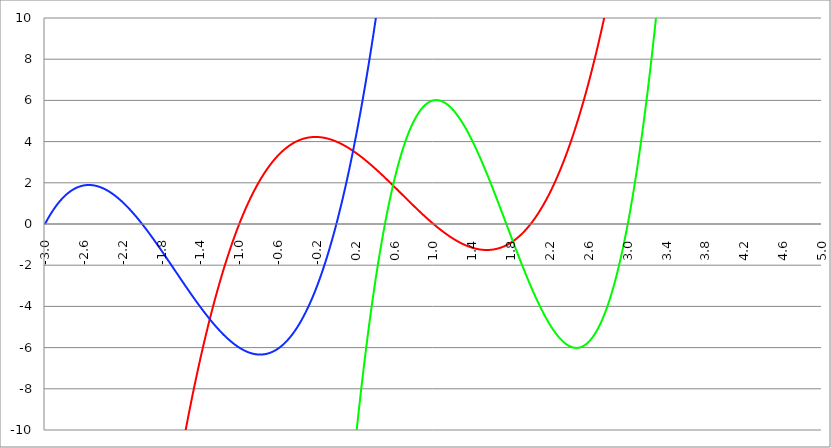
| Category | Series 1 | Series 0 | Series 2 |
|---|---|---|---|
| -3.0 | -80 | -798 | 0 |
| -2.996 | -79.696 | -795.886 | 0.036 |
| -2.992 | -79.393 | -793.775 | 0.071 |
| -2.988 | -79.091 | -791.668 | 0.106 |
| -2.984 | -78.79 | -789.565 | 0.141 |
| -2.98 | -78.489 | -787.466 | 0.175 |
| -2.976 | -78.189 | -785.37 | 0.209 |
| -2.972 | -77.889 | -783.277 | 0.243 |
| -2.968 | -77.59 | -781.188 | 0.276 |
| -2.964 | -77.292 | -779.103 | 0.309 |
| -2.96 | -76.995 | -777.022 | 0.341 |
| -2.956 | -76.698 | -774.944 | 0.373 |
| -2.952 | -76.402 | -772.87 | 0.405 |
| -2.948 | -76.107 | -770.799 | 0.436 |
| -2.944 | -75.813 | -768.732 | 0.467 |
| -2.94 | -75.519 | -766.669 | 0.497 |
| -2.936 | -75.226 | -764.609 | 0.528 |
| -2.932 | -74.933 | -762.553 | 0.557 |
| -2.928 | -74.641 | -760.5 | 0.587 |
| -2.924 | -74.35 | -758.451 | 0.616 |
| -2.92 | -74.06 | -756.406 | 0.645 |
| -2.916 | -73.77 | -754.364 | 0.673 |
| -2.912 | -73.481 | -752.325 | 0.701 |
| -2.908 | -73.193 | -750.291 | 0.729 |
| -2.904 | -72.905 | -748.26 | 0.756 |
| -2.9 | -72.618 | -746.232 | 0.783 |
| -2.896 | -72.332 | -744.208 | 0.81 |
| -2.892 | -72.046 | -742.188 | 0.836 |
| -2.888 | -71.761 | -740.171 | 0.862 |
| -2.884 | -71.477 | -738.157 | 0.887 |
| -2.88 | -71.193 | -736.148 | 0.912 |
| -2.876 | -70.91 | -734.142 | 0.937 |
| -2.872 | -70.628 | -732.139 | 0.962 |
| -2.868 | -70.347 | -730.14 | 0.986 |
| -2.864 | -70.066 | -728.144 | 1.01 |
| -2.86 | -69.786 | -726.152 | 1.033 |
| -2.856 | -69.506 | -724.164 | 1.056 |
| -2.852 | -69.227 | -722.179 | 1.079 |
| -2.848 | -68.949 | -720.198 | 1.101 |
| -2.844 | -68.672 | -718.22 | 1.123 |
| -2.84 | -68.395 | -716.246 | 1.145 |
| -2.836 | -68.119 | -714.275 | 1.166 |
| -2.832 | -67.843 | -712.308 | 1.188 |
| -2.828 | -67.569 | -710.344 | 1.208 |
| -2.824 | -67.295 | -708.384 | 1.229 |
| -2.82 | -67.021 | -706.427 | 1.249 |
| -2.816 | -66.748 | -704.474 | 1.268 |
| -2.812 | -66.476 | -702.524 | 1.288 |
| -2.808 | -66.205 | -700.578 | 1.307 |
| -2.804 | -65.934 | -698.635 | 1.326 |
| -2.8 | -65.664 | -696.696 | 1.344 |
| -2.796 | -65.395 | -694.76 | 1.362 |
| -2.792 | -65.126 | -692.828 | 1.38 |
| -2.788 | -64.858 | -690.899 | 1.397 |
| -2.784 | -64.59 | -688.974 | 1.414 |
| -2.78 | -64.324 | -687.052 | 1.431 |
| -2.776 | -64.057 | -685.134 | 1.448 |
| -2.772 | -63.792 | -683.219 | 1.464 |
| -2.768 | -63.527 | -681.308 | 1.48 |
| -2.764 | -63.263 | -679.4 | 1.495 |
| -2.76 | -63 | -677.496 | 1.51 |
| -2.756 | -62.737 | -675.595 | 1.525 |
| -2.752 | -62.475 | -673.697 | 1.54 |
| -2.748 | -62.213 | -671.803 | 1.554 |
| -2.744 | -61.952 | -669.913 | 1.568 |
| -2.74 | -61.692 | -668.026 | 1.582 |
| -2.736 | -61.433 | -666.142 | 1.595 |
| -2.732 | -61.174 | -664.262 | 1.608 |
| -2.728 | -60.915 | -662.385 | 1.621 |
| -2.724 | -60.658 | -660.512 | 1.633 |
| -2.72 | -60.401 | -658.642 | 1.645 |
| -2.716 | -60.145 | -656.776 | 1.657 |
| -2.712 | -59.889 | -654.913 | 1.668 |
| -2.708 | -59.634 | -653.053 | 1.68 |
| -2.704 | -59.38 | -651.197 | 1.69 |
| -2.7 | -59.126 | -649.344 | 1.701 |
| -2.696 | -58.873 | -647.495 | 1.711 |
| -2.692 | -58.621 | -645.649 | 1.721 |
| -2.688 | -58.369 | -643.806 | 1.731 |
| -2.684 | -58.118 | -641.967 | 1.74 |
| -2.68 | -57.867 | -640.131 | 1.75 |
| -2.676 | -57.617 | -638.299 | 1.758 |
| -2.672 | -57.368 | -636.47 | 1.767 |
| -2.668 | -57.12 | -634.645 | 1.775 |
| -2.664 | -56.872 | -632.823 | 1.783 |
| -2.66 | -56.625 | -631.004 | 1.791 |
| -2.656 | -56.378 | -629.189 | 1.798 |
| -2.652 | -56.132 | -627.377 | 1.805 |
| -2.648 | -55.887 | -625.568 | 1.812 |
| -2.644 | -55.642 | -623.763 | 1.819 |
| -2.64 | -55.398 | -621.961 | 1.825 |
| -2.636 | -55.154 | -620.163 | 1.831 |
| -2.632 | -54.912 | -618.368 | 1.836 |
| -2.628 | -54.669 | -616.576 | 1.842 |
| -2.624 | -54.428 | -614.788 | 1.847 |
| -2.62 | -54.187 | -613.003 | 1.852 |
| -2.616 | -53.947 | -611.221 | 1.856 |
| -2.612 | -53.707 | -609.443 | 1.861 |
| -2.608 | -53.468 | -607.668 | 1.865 |
| -2.604 | -53.23 | -605.896 | 1.869 |
| -2.6 | -52.992 | -604.128 | 1.872 |
| -2.596 | -52.755 | -602.363 | 1.875 |
| -2.592 | -52.518 | -600.602 | 1.878 |
| -2.588 | -52.282 | -598.843 | 1.881 |
| -2.584 | -52.047 | -597.088 | 1.883 |
| -2.58 | -51.813 | -595.337 | 1.885 |
| -2.576 | -51.579 | -593.589 | 1.887 |
| -2.572 | -51.345 | -591.844 | 1.889 |
| -2.568 | -51.112 | -590.102 | 1.89 |
| -2.564 | -50.88 | -588.364 | 1.891 |
| -2.56 | -50.649 | -586.629 | 1.892 |
| -2.556 | -50.418 | -584.897 | 1.893 |
| -2.552 | -50.188 | -583.169 | 1.893 |
| -2.548 | -49.958 | -581.444 | 1.893 |
| -2.544 | -49.729 | -579.722 | 1.893 |
| -2.54 | -49.501 | -578.004 | 1.893 |
| -2.536 | -49.273 | -576.289 | 1.892 |
| -2.532 | -49.046 | -574.577 | 1.891 |
| -2.528 | -48.819 | -572.868 | 1.89 |
| -2.524 | -48.593 | -571.163 | 1.889 |
| -2.52 | -48.368 | -569.461 | 1.887 |
| -2.516 | -48.143 | -567.762 | 1.885 |
| -2.512 | -47.919 | -566.067 | 1.883 |
| -2.508 | -47.695 | -564.375 | 1.881 |
| -2.504 | -47.472 | -562.686 | 1.878 |
| -2.5 | -47.25 | -561 | 1.875 |
| -2.496 | -47.028 | -559.318 | 1.872 |
| -2.492 | -46.807 | -557.639 | 1.869 |
| -2.488 | -46.587 | -555.963 | 1.865 |
| -2.484 | -46.367 | -554.29 | 1.861 |
| -2.48 | -46.148 | -552.621 | 1.857 |
| -2.476 | -45.929 | -550.955 | 1.853 |
| -2.472 | -45.711 | -549.292 | 1.848 |
| -2.467999999999999 | -45.493 | -547.632 | 1.843 |
| -2.463999999999999 | -45.277 | -545.976 | 1.838 |
| -2.459999999999999 | -45.06 | -544.323 | 1.833 |
| -2.455999999999999 | -44.845 | -542.673 | 1.828 |
| -2.451999999999999 | -44.63 | -541.026 | 1.822 |
| -2.447999999999999 | -44.415 | -539.383 | 1.816 |
| -2.443999999999999 | -44.201 | -537.742 | 1.81 |
| -2.439999999999999 | -43.988 | -536.105 | 1.804 |
| -2.435999999999999 | -43.775 | -534.472 | 1.797 |
| -2.431999999999999 | -43.563 | -532.841 | 1.79 |
| -2.427999999999999 | -43.352 | -531.214 | 1.783 |
| -2.423999999999999 | -43.141 | -529.59 | 1.776 |
| -2.419999999999999 | -42.931 | -527.969 | 1.769 |
| -2.415999999999999 | -42.721 | -526.351 | 1.761 |
| -2.411999999999999 | -42.512 | -524.736 | 1.753 |
| -2.407999999999999 | -42.303 | -523.125 | 1.745 |
| -2.403999999999999 | -42.095 | -521.517 | 1.737 |
| -2.399999999999999 | -41.888 | -519.912 | 1.728 |
| -2.395999999999999 | -41.681 | -518.31 | 1.719 |
| -2.391999999999999 | -41.475 | -516.712 | 1.71 |
| -2.387999999999999 | -41.27 | -515.116 | 1.701 |
| -2.383999999999999 | -41.065 | -513.524 | 1.692 |
| -2.379999999999999 | -40.86 | -511.935 | 1.682 |
| -2.375999999999999 | -40.656 | -510.349 | 1.672 |
| -2.371999999999999 | -40.453 | -508.766 | 1.662 |
| -2.367999999999999 | -40.25 | -507.187 | 1.652 |
| -2.363999999999999 | -40.048 | -505.61 | 1.642 |
| -2.359999999999999 | -39.847 | -504.037 | 1.631 |
| -2.355999999999999 | -39.646 | -502.467 | 1.62 |
| -2.351999999999999 | -39.446 | -500.9 | 1.609 |
| -2.347999999999999 | -39.246 | -499.337 | 1.598 |
| -2.343999999999999 | -39.047 | -497.776 | 1.587 |
| -2.339999999999999 | -38.848 | -496.218 | 1.575 |
| -2.335999999999999 | -38.65 | -494.664 | 1.564 |
| -2.331999999999999 | -38.453 | -493.113 | 1.552 |
| -2.327999999999999 | -38.256 | -491.565 | 1.539 |
| -2.323999999999999 | -38.06 | -490.02 | 1.527 |
| -2.319999999999999 | -37.864 | -488.478 | 1.514 |
| -2.315999999999999 | -37.669 | -486.939 | 1.502 |
| -2.311999999999999 | -37.474 | -485.404 | 1.489 |
| -2.307999999999999 | -37.28 | -483.872 | 1.476 |
| -2.303999999999999 | -37.087 | -482.342 | 1.462 |
| -2.299999999999999 | -36.894 | -480.816 | 1.449 |
| -2.295999999999999 | -36.702 | -479.293 | 1.435 |
| -2.291999999999999 | -36.51 | -477.773 | 1.422 |
| -2.288 | -36.319 | -476.256 | 1.408 |
| -2.284 | -36.128 | -474.742 | 1.393 |
| -2.279999999999999 | -35.938 | -473.232 | 1.379 |
| -2.275999999999999 | -35.749 | -471.724 | 1.364 |
| -2.271999999999999 | -35.56 | -470.22 | 1.35 |
| -2.268 | -35.372 | -468.718 | 1.335 |
| -2.264 | -35.184 | -467.22 | 1.32 |
| -2.259999999999999 | -34.997 | -465.725 | 1.304 |
| -2.255999999999999 | -34.81 | -464.232 | 1.289 |
| -2.251999999999999 | -34.624 | -462.743 | 1.273 |
| -2.248 | -34.439 | -461.257 | 1.258 |
| -2.244 | -34.254 | -459.774 | 1.242 |
| -2.239999999999999 | -34.069 | -458.295 | 1.226 |
| -2.235999999999999 | -33.885 | -456.818 | 1.209 |
| -2.231999999999999 | -33.702 | -455.344 | 1.193 |
| -2.228 | -33.519 | -453.873 | 1.176 |
| -2.224 | -33.337 | -452.406 | 1.16 |
| -2.219999999999999 | -33.156 | -450.941 | 1.143 |
| -2.215999999999999 | -32.975 | -449.48 | 1.126 |
| -2.211999999999999 | -32.794 | -448.021 | 1.109 |
| -2.208 | -32.614 | -446.566 | 1.091 |
| -2.204 | -32.435 | -445.113 | 1.074 |
| -2.199999999999999 | -32.256 | -443.664 | 1.056 |
| -2.195999999999999 | -32.078 | -442.218 | 1.038 |
| -2.191999999999999 | -31.9 | -440.774 | 1.02 |
| -2.188 | -31.723 | -439.334 | 1.002 |
| -2.184 | -31.546 | -437.897 | 0.984 |
| -2.179999999999999 | -31.37 | -436.463 | 0.965 |
| -2.175999999999999 | -31.195 | -435.031 | 0.947 |
| -2.171999999999999 | -31.02 | -433.603 | 0.928 |
| -2.168 | -30.845 | -432.178 | 0.909 |
| -2.164 | -30.671 | -430.756 | 0.89 |
| -2.159999999999999 | -30.498 | -429.337 | 0.871 |
| -2.155999999999999 | -30.325 | -427.921 | 0.852 |
| -2.151999999999999 | -30.153 | -426.507 | 0.832 |
| -2.148 | -29.981 | -425.097 | 0.813 |
| -2.144 | -29.81 | -423.69 | 0.793 |
| -2.139999999999999 | -29.639 | -422.286 | 0.773 |
| -2.135999999999999 | -29.469 | -420.885 | 0.753 |
| -2.131999999999999 | -29.299 | -419.487 | 0.733 |
| -2.128 | -29.13 | -418.091 | 0.713 |
| -2.124 | -28.962 | -416.699 | 0.692 |
| -2.119999999999999 | -28.794 | -415.31 | 0.672 |
| -2.115999999999999 | -28.626 | -413.924 | 0.651 |
| -2.111999999999999 | -28.46 | -412.54 | 0.63 |
| -2.108 | -28.293 | -411.16 | 0.609 |
| -2.104 | -28.127 | -409.782 | 0.588 |
| -2.099999999999999 | -27.962 | -408.408 | 0.567 |
| -2.095999999999999 | -27.797 | -407.037 | 0.546 |
| -2.091999999999999 | -27.633 | -405.668 | 0.524 |
| -2.088 | -27.469 | -404.302 | 0.503 |
| -2.084 | -27.306 | -402.94 | 0.481 |
| -2.079999999999999 | -27.143 | -401.58 | 0.459 |
| -2.075999999999999 | -26.981 | -400.223 | 0.437 |
| -2.071999999999999 | -26.82 | -398.87 | 0.415 |
| -2.068 | -26.659 | -397.519 | 0.393 |
| -2.064 | -26.498 | -396.171 | 0.371 |
| -2.059999999999999 | -26.338 | -394.826 | 0.349 |
| -2.055999999999999 | -26.179 | -393.484 | 0.326 |
| -2.051999999999999 | -26.02 | -392.144 | 0.303 |
| -2.048 | -25.861 | -390.808 | 0.281 |
| -2.044 | -25.703 | -389.475 | 0.258 |
| -2.039999999999999 | -25.546 | -388.145 | 0.235 |
| -2.035999999999999 | -25.389 | -386.817 | 0.212 |
| -2.031999999999999 | -25.232 | -385.492 | 0.189 |
| -2.028 | -25.077 | -384.171 | 0.166 |
| -2.024 | -24.921 | -382.852 | 0.142 |
| -2.019999999999999 | -24.766 | -381.536 | 0.119 |
| -2.015999999999999 | -24.612 | -380.223 | 0.095 |
| -2.011999999999999 | -24.458 | -378.913 | 0.072 |
| -2.008 | -24.305 | -377.606 | 0.048 |
| -2.004 | -24.152 | -376.301 | 0.024 |
| -1.999999999999999 | -24 | -375 | 0 |
| -1.995999999999999 | -23.848 | -373.701 | -0.024 |
| -1.991999999999999 | -23.697 | -372.406 | -0.048 |
| -1.987999999999999 | -23.546 | -371.113 | -0.072 |
| -1.983999999999999 | -23.396 | -369.823 | -0.097 |
| -1.979999999999999 | -23.246 | -368.536 | -0.121 |
| -1.975999999999999 | -23.097 | -367.252 | -0.146 |
| -1.971999999999999 | -22.949 | -365.97 | -0.17 |
| -1.967999999999999 | -22.8 | -364.692 | -0.195 |
| -1.963999999999999 | -22.653 | -363.416 | -0.22 |
| -1.959999999999999 | -22.505 | -362.143 | -0.245 |
| -1.955999999999999 | -22.359 | -360.874 | -0.27 |
| -1.951999999999999 | -22.213 | -359.606 | -0.295 |
| -1.947999999999999 | -22.067 | -358.342 | -0.32 |
| -1.943999999999999 | -21.922 | -357.081 | -0.345 |
| -1.939999999999999 | -21.777 | -355.822 | -0.37 |
| -1.935999999999999 | -21.633 | -354.567 | -0.396 |
| -1.931999999999999 | -21.489 | -353.314 | -0.421 |
| -1.927999999999999 | -21.346 | -352.064 | -0.446 |
| -1.923999999999999 | -21.204 | -350.816 | -0.472 |
| -1.919999999999999 | -21.061 | -349.572 | -0.498 |
| -1.915999999999999 | -20.92 | -348.33 | -0.523 |
| -1.911999999999999 | -20.779 | -347.092 | -0.549 |
| -1.907999999999999 | -20.638 | -345.856 | -0.575 |
| -1.903999999999999 | -20.498 | -344.622 | -0.601 |
| -1.899999999999999 | -20.358 | -343.392 | -0.627 |
| -1.895999999999999 | -20.219 | -342.164 | -0.653 |
| -1.891999999999999 | -20.08 | -340.94 | -0.679 |
| -1.887999999999999 | -19.942 | -339.718 | -0.705 |
| -1.883999999999999 | -19.804 | -338.499 | -0.732 |
| -1.879999999999999 | -19.667 | -337.282 | -0.758 |
| -1.875999999999999 | -19.53 | -336.069 | -0.784 |
| -1.871999999999999 | -19.394 | -334.858 | -0.811 |
| -1.867999999999999 | -19.258 | -333.65 | -0.837 |
| -1.863999999999999 | -19.123 | -332.445 | -0.864 |
| -1.859999999999999 | -18.988 | -331.242 | -0.891 |
| -1.855999999999999 | -18.854 | -330.042 | -0.917 |
| -1.851999999999999 | -18.72 | -328.845 | -0.944 |
| -1.847999999999999 | -18.587 | -327.651 | -0.971 |
| -1.843999999999999 | -18.454 | -326.46 | -0.998 |
| -1.839999999999999 | -18.321 | -325.271 | -1.025 |
| -1.835999999999999 | -18.19 | -324.085 | -1.051 |
| -1.831999999999999 | -18.058 | -322.902 | -1.078 |
| -1.827999999999999 | -17.927 | -321.722 | -1.105 |
| -1.823999999999999 | -17.797 | -320.544 | -1.133 |
| -1.819999999999999 | -17.667 | -319.369 | -1.16 |
| -1.815999999999999 | -17.537 | -318.197 | -1.187 |
| -1.811999999999999 | -17.408 | -317.028 | -1.214 |
| -1.807999999999999 | -17.28 | -315.861 | -1.241 |
| -1.803999999999999 | -17.152 | -314.697 | -1.269 |
| -1.799999999999999 | -17.024 | -313.536 | -1.296 |
| -1.795999999999999 | -16.897 | -312.378 | -1.323 |
| -1.791999999999999 | -16.77 | -311.222 | -1.351 |
| -1.787999999999999 | -16.644 | -310.069 | -1.378 |
| -1.783999999999999 | -16.518 | -308.918 | -1.406 |
| -1.779999999999999 | -16.393 | -307.771 | -1.433 |
| -1.775999999999999 | -16.268 | -306.626 | -1.461 |
| -1.771999999999999 | -16.144 | -305.484 | -1.488 |
| -1.767999999999999 | -16.02 | -304.344 | -1.516 |
| -1.763999999999999 | -15.897 | -303.207 | -1.544 |
| -1.759999999999999 | -15.774 | -302.073 | -1.571 |
| -1.755999999999999 | -15.652 | -300.942 | -1.599 |
| -1.751999999999999 | -15.53 | -299.813 | -1.627 |
| -1.747999999999999 | -15.408 | -298.687 | -1.655 |
| -1.743999999999999 | -15.287 | -297.564 | -1.682 |
| -1.739999999999999 | -15.166 | -296.443 | -1.71 |
| -1.735999999999999 | -15.046 | -295.325 | -1.738 |
| -1.731999999999999 | -14.927 | -294.21 | -1.766 |
| -1.727999999999999 | -14.807 | -293.098 | -1.794 |
| -1.723999999999999 | -14.689 | -291.988 | -1.821 |
| -1.719999999999999 | -14.57 | -290.88 | -1.849 |
| -1.715999999999999 | -14.453 | -289.776 | -1.877 |
| -1.711999999999999 | -14.335 | -288.674 | -1.905 |
| -1.707999999999999 | -14.218 | -287.575 | -1.933 |
| -1.703999999999999 | -14.102 | -286.478 | -1.961 |
| -1.699999999999999 | -13.986 | -285.384 | -1.989 |
| -1.695999999999999 | -13.87 | -284.293 | -2.017 |
| -1.691999999999999 | -13.755 | -283.204 | -2.045 |
| -1.687999999999999 | -13.641 | -282.118 | -2.073 |
| -1.683999999999999 | -13.527 | -281.035 | -2.101 |
| -1.679999999999999 | -13.413 | -279.954 | -2.129 |
| -1.675999999999999 | -13.3 | -278.876 | -2.157 |
| -1.671999999999999 | -13.187 | -277.8 | -2.185 |
| -1.667999999999999 | -13.074 | -276.727 | -2.213 |
| -1.663999999999999 | -12.962 | -275.657 | -2.241 |
| -1.659999999999999 | -12.851 | -274.59 | -2.269 |
| -1.655999999999999 | -12.74 | -273.525 | -2.297 |
| -1.651999999999999 | -12.629 | -272.462 | -2.325 |
| -1.647999999999999 | -12.519 | -271.402 | -2.353 |
| -1.643999999999999 | -12.41 | -270.345 | -2.381 |
| -1.639999999999999 | -12.3 | -269.291 | -2.409 |
| -1.635999999999999 | -12.191 | -268.239 | -2.437 |
| -1.631999999999999 | -12.083 | -267.189 | -2.465 |
| -1.627999999999999 | -11.975 | -266.143 | -2.493 |
| -1.623999999999999 | -11.868 | -265.099 | -2.521 |
| -1.619999999999999 | -11.761 | -264.057 | -2.549 |
| -1.615999999999999 | -11.654 | -263.018 | -2.576 |
| -1.611999999999999 | -11.548 | -261.982 | -2.604 |
| -1.607999999999999 | -11.442 | -260.948 | -2.632 |
| -1.603999999999999 | -11.337 | -259.917 | -2.66 |
| -1.599999999999999 | -11.232 | -258.888 | -2.688 |
| -1.595999999999999 | -11.128 | -257.862 | -2.716 |
| -1.591999999999999 | -11.024 | -256.838 | -2.744 |
| -1.587999999999999 | -10.92 | -255.817 | -2.771 |
| -1.583999999999999 | -10.817 | -254.799 | -2.799 |
| -1.579999999999999 | -10.714 | -253.783 | -2.827 |
| -1.575999999999999 | -10.612 | -252.77 | -2.855 |
| -1.571999999999999 | -10.51 | -251.759 | -2.882 |
| -1.567999999999999 | -10.409 | -250.751 | -2.91 |
| -1.563999999999999 | -10.308 | -249.746 | -2.938 |
| -1.559999999999999 | -10.207 | -248.743 | -2.965 |
| -1.555999999999999 | -10.107 | -247.742 | -2.993 |
| -1.551999999999999 | -10.007 | -246.744 | -3.02 |
| -1.547999999999999 | -9.908 | -245.749 | -3.048 |
| -1.543999999999999 | -9.809 | -244.756 | -3.075 |
| -1.539999999999999 | -9.711 | -243.765 | -3.103 |
| -1.535999999999999 | -9.613 | -242.777 | -3.13 |
| -1.531999999999999 | -9.515 | -241.792 | -3.158 |
| -1.527999999999999 | -9.418 | -240.809 | -3.185 |
| -1.523999999999999 | -9.322 | -239.829 | -3.212 |
| -1.519999999999999 | -9.225 | -238.851 | -3.239 |
| -1.515999999999999 | -9.129 | -237.876 | -3.267 |
| -1.511999999999999 | -9.034 | -236.903 | -3.294 |
| -1.507999999999999 | -8.939 | -235.933 | -3.321 |
| -1.503999999999999 | -8.844 | -234.965 | -3.348 |
| -1.499999999999999 | -8.75 | -234 | -3.375 |
| -1.495999999999999 | -8.656 | -233.037 | -3.402 |
| -1.491999999999999 | -8.563 | -232.077 | -3.429 |
| -1.487999999999999 | -8.47 | -231.119 | -3.456 |
| -1.483999999999999 | -8.377 | -230.164 | -3.483 |
| -1.479999999999999 | -8.285 | -229.211 | -3.509 |
| -1.475999999999999 | -8.193 | -228.261 | -3.536 |
| -1.471999999999999 | -8.102 | -227.313 | -3.563 |
| -1.467999999999999 | -8.011 | -226.368 | -3.589 |
| -1.463999999999999 | -7.921 | -225.425 | -3.616 |
| -1.459999999999999 | -7.831 | -224.484 | -3.642 |
| -1.455999999999999 | -7.741 | -223.546 | -3.669 |
| -1.451999999999999 | -7.652 | -222.611 | -3.695 |
| -1.447999999999999 | -7.563 | -221.678 | -3.722 |
| -1.443999999999999 | -7.474 | -220.747 | -3.748 |
| -1.439999999999999 | -7.386 | -219.819 | -3.774 |
| -1.435999999999999 | -7.299 | -218.893 | -3.8 |
| -1.431999999999999 | -7.211 | -217.97 | -3.826 |
| -1.427999999999999 | -7.125 | -217.049 | -3.852 |
| -1.423999999999999 | -7.038 | -216.131 | -3.878 |
| -1.419999999999999 | -6.952 | -215.215 | -3.904 |
| -1.415999999999999 | -6.867 | -214.302 | -3.93 |
| -1.411999999999999 | -6.781 | -213.391 | -3.955 |
| -1.407999999999999 | -6.696 | -212.482 | -3.981 |
| -1.403999999999999 | -6.612 | -211.576 | -4.007 |
| -1.399999999999999 | -6.528 | -210.672 | -4.032 |
| -1.395999999999999 | -6.444 | -209.771 | -4.057 |
| -1.391999999999999 | -6.361 | -208.872 | -4.083 |
| -1.387999999999999 | -6.278 | -207.975 | -4.108 |
| -1.383999999999999 | -6.196 | -207.081 | -4.133 |
| -1.379999999999999 | -6.114 | -206.189 | -4.158 |
| -1.375999999999999 | -6.032 | -205.3 | -4.183 |
| -1.371999999999999 | -5.951 | -204.413 | -4.208 |
| -1.367999999999998 | -5.87 | -203.529 | -4.233 |
| -1.363999999999998 | -5.789 | -202.647 | -4.258 |
| -1.359999999999998 | -5.709 | -201.767 | -4.282 |
| -1.355999999999998 | -5.63 | -200.89 | -4.307 |
| -1.351999999999998 | -5.55 | -200.015 | -4.331 |
| -1.347999999999998 | -5.471 | -199.142 | -4.356 |
| -1.343999999999998 | -5.393 | -198.272 | -4.38 |
| -1.339999999999998 | -5.315 | -197.404 | -4.404 |
| -1.335999999999998 | -5.237 | -196.539 | -4.428 |
| -1.331999999999998 | -5.159 | -195.676 | -4.452 |
| -1.327999999999998 | -5.082 | -194.815 | -4.476 |
| -1.323999999999998 | -5.006 | -193.957 | -4.5 |
| -1.319999999999998 | -4.93 | -193.101 | -4.524 |
| -1.315999999999998 | -4.854 | -192.247 | -4.548 |
| -1.311999999999998 | -4.778 | -191.396 | -4.571 |
| -1.307999999999998 | -4.703 | -190.547 | -4.594 |
| -1.303999999999998 | -4.628 | -189.7 | -4.618 |
| -1.299999999999998 | -4.554 | -188.856 | -4.641 |
| -1.295999999999998 | -4.48 | -188.014 | -4.664 |
| -1.291999999999998 | -4.406 | -187.175 | -4.687 |
| -1.287999999999998 | -4.333 | -186.337 | -4.71 |
| -1.283999999999998 | -4.26 | -185.503 | -4.733 |
| -1.279999999999998 | -4.188 | -184.67 | -4.755 |
| -1.275999999999998 | -4.116 | -183.84 | -4.778 |
| -1.271999999999998 | -4.044 | -183.012 | -4.8 |
| -1.267999999999998 | -3.973 | -182.186 | -4.823 |
| -1.263999999999998 | -3.902 | -181.363 | -4.845 |
| -1.259999999999998 | -3.831 | -180.542 | -4.867 |
| -1.255999999999998 | -3.761 | -179.724 | -4.889 |
| -1.251999999999998 | -3.691 | -178.907 | -4.911 |
| -1.247999999999998 | -3.622 | -178.093 | -4.933 |
| -1.243999999999998 | -3.552 | -177.282 | -4.954 |
| -1.239999999999998 | -3.484 | -176.472 | -4.976 |
| -1.235999999999998 | -3.415 | -175.665 | -4.997 |
| -1.231999999999998 | -3.347 | -174.86 | -5.019 |
| -1.227999999999998 | -3.28 | -174.058 | -5.04 |
| -1.223999999999998 | -3.212 | -173.258 | -5.061 |
| -1.219999999999998 | -3.145 | -172.46 | -5.082 |
| -1.215999999999998 | -3.079 | -171.664 | -5.102 |
| -1.211999999999998 | -3.012 | -170.871 | -5.123 |
| -1.207999999999998 | -2.947 | -170.079 | -5.143 |
| -1.203999999999998 | -2.881 | -169.291 | -5.164 |
| -1.199999999999998 | -2.816 | -168.504 | -5.184 |
| -1.195999999999998 | -2.751 | -167.72 | -5.204 |
| -1.191999999999998 | -2.687 | -166.938 | -5.224 |
| -1.187999999999998 | -2.623 | -166.158 | -5.244 |
| -1.183999999999998 | -2.559 | -165.38 | -5.264 |
| -1.179999999999998 | -2.496 | -164.605 | -5.283 |
| -1.175999999999998 | -2.433 | -163.832 | -5.302 |
| -1.171999999999998 | -2.37 | -163.061 | -5.322 |
| -1.167999999999998 | -2.308 | -162.293 | -5.341 |
| -1.163999999999998 | -2.246 | -161.526 | -5.36 |
| -1.159999999999998 | -2.184 | -160.762 | -5.379 |
| -1.155999999999998 | -2.123 | -160.001 | -5.397 |
| -1.151999999999998 | -2.062 | -159.241 | -5.416 |
| -1.147999999999998 | -2.002 | -158.484 | -5.434 |
| -1.143999999999998 | -1.941 | -157.728 | -5.453 |
| -1.139999999999998 | -1.881 | -156.976 | -5.471 |
| -1.135999999999998 | -1.822 | -156.225 | -5.489 |
| -1.131999999999998 | -1.763 | -155.476 | -5.506 |
| -1.127999999999998 | -1.704 | -154.73 | -5.524 |
| -1.123999999999998 | -1.646 | -153.986 | -5.541 |
| -1.119999999999998 | -1.587 | -153.244 | -5.559 |
| -1.115999999999998 | -1.53 | -152.505 | -5.576 |
| -1.111999999999998 | -1.472 | -151.767 | -5.593 |
| -1.107999999999998 | -1.415 | -151.032 | -5.61 |
| -1.103999999999998 | -1.358 | -150.299 | -5.626 |
| -1.099999999999998 | -1.302 | -149.568 | -5.643 |
| -1.095999999999998 | -1.246 | -148.839 | -5.659 |
| -1.091999999999998 | -1.19 | -148.113 | -5.676 |
| -1.087999999999998 | -1.135 | -147.389 | -5.692 |
| -1.083999999999998 | -1.08 | -146.666 | -5.707 |
| -1.079999999999998 | -1.025 | -145.946 | -5.723 |
| -1.075999999999998 | -0.971 | -145.229 | -5.739 |
| -1.071999999999998 | -0.917 | -144.513 | -5.754 |
| -1.067999999999998 | -0.863 | -143.8 | -5.769 |
| -1.063999999999998 | -0.809 | -143.088 | -5.784 |
| -1.059999999999998 | -0.756 | -142.379 | -5.799 |
| -1.055999999999998 | -0.704 | -141.672 | -5.814 |
| -1.051999999999998 | -0.651 | -140.968 | -5.828 |
| -1.047999999999998 | -0.599 | -140.265 | -5.843 |
| -1.043999999999998 | -0.548 | -139.564 | -5.857 |
| -1.039999999999998 | -0.496 | -138.866 | -5.871 |
| -1.035999999999998 | -0.445 | -138.17 | -5.884 |
| -1.031999999999998 | -0.394 | -137.476 | -5.898 |
| -1.027999999999998 | -0.344 | -136.784 | -5.911 |
| -1.023999999999998 | -0.294 | -136.094 | -5.925 |
| -1.019999999999998 | -0.244 | -135.406 | -5.938 |
| -1.015999999999998 | -0.195 | -134.721 | -5.95 |
| -1.011999999999998 | -0.145 | -134.038 | -5.963 |
| -1.007999999999998 | -0.097 | -133.356 | -5.976 |
| -1.003999999999998 | -0.048 | -132.677 | -5.988 |
| -0.999999999999998 | 0 | -132 | -6 |
| -0.995999999999998 | 0.048 | -131.325 | -6.012 |
| -0.991999999999998 | 0.095 | -130.652 | -6.024 |
| -0.987999999999998 | 0.143 | -129.981 | -6.035 |
| -0.983999999999998 | 0.189 | -129.313 | -6.046 |
| -0.979999999999998 | 0.236 | -128.646 | -6.058 |
| -0.975999999999998 | 0.282 | -127.982 | -6.069 |
| -0.971999999999998 | 0.328 | -127.32 | -6.079 |
| -0.967999999999998 | 0.374 | -126.659 | -6.09 |
| -0.963999999999998 | 0.419 | -126.001 | -6.1 |
| -0.959999999999998 | 0.464 | -125.345 | -6.11 |
| -0.955999999999998 | 0.509 | -124.691 | -6.12 |
| -0.951999999999998 | 0.553 | -124.039 | -6.13 |
| -0.947999999999998 | 0.597 | -123.389 | -6.139 |
| -0.943999999999998 | 0.641 | -122.742 | -6.149 |
| -0.939999999999998 | 0.684 | -122.096 | -6.158 |
| -0.935999999999998 | 0.728 | -121.452 | -6.167 |
| -0.931999999999998 | 0.77 | -120.811 | -6.175 |
| -0.927999999999998 | 0.813 | -120.171 | -6.184 |
| -0.923999999999998 | 0.855 | -119.534 | -6.192 |
| -0.919999999999998 | 0.897 | -118.898 | -6.2 |
| -0.915999999999998 | 0.939 | -118.265 | -6.208 |
| -0.911999999999998 | 0.98 | -117.634 | -6.215 |
| -0.907999999999998 | 1.021 | -117.004 | -6.223 |
| -0.903999999999998 | 1.062 | -116.377 | -6.23 |
| -0.899999999999998 | 1.102 | -115.752 | -6.237 |
| -0.895999999999998 | 1.142 | -115.129 | -6.244 |
| -0.891999999999998 | 1.182 | -114.508 | -6.25 |
| -0.887999999999998 | 1.221 | -113.889 | -6.257 |
| -0.883999999999998 | 1.261 | -113.272 | -6.263 |
| -0.879999999999998 | 1.299 | -112.657 | -6.268 |
| -0.875999999999998 | 1.338 | -112.044 | -6.274 |
| -0.871999999999998 | 1.376 | -111.433 | -6.279 |
| -0.867999999999998 | 1.414 | -110.824 | -6.285 |
| -0.863999999999998 | 1.452 | -110.217 | -6.289 |
| -0.859999999999998 | 1.489 | -109.612 | -6.294 |
| -0.855999999999998 | 1.527 | -109.009 | -6.299 |
| -0.851999999999998 | 1.563 | -108.408 | -6.303 |
| -0.847999999999998 | 1.6 | -107.809 | -6.307 |
| -0.843999999999998 | 1.636 | -107.212 | -6.311 |
| -0.839999999999998 | 1.672 | -106.617 | -6.314 |
| -0.835999999999998 | 1.708 | -106.024 | -6.317 |
| -0.831999999999998 | 1.743 | -105.433 | -6.32 |
| -0.827999999999998 | 1.778 | -104.844 | -6.323 |
| -0.823999999999998 | 1.813 | -104.257 | -6.326 |
| -0.819999999999998 | 1.848 | -103.672 | -6.328 |
| -0.815999999999998 | 1.882 | -103.089 | -6.33 |
| -0.811999999999998 | 1.916 | -102.508 | -6.332 |
| -0.807999999999998 | 1.95 | -101.928 | -6.334 |
| -0.803999999999998 | 1.983 | -101.351 | -6.335 |
| -0.799999999999998 | 2.016 | -100.776 | -6.336 |
| -0.795999999999998 | 2.049 | -100.203 | -6.337 |
| -0.791999999999998 | 2.081 | -99.631 | -6.337 |
| -0.787999999999998 | 2.114 | -99.062 | -6.338 |
| -0.783999999999998 | 2.146 | -98.495 | -6.338 |
| -0.779999999999998 | 2.177 | -97.929 | -6.338 |
| -0.775999999999998 | 2.209 | -97.366 | -6.337 |
| -0.771999999999998 | 2.24 | -96.804 | -6.337 |
| -0.767999999999998 | 2.271 | -96.244 | -6.336 |
| -0.763999999999998 | 2.301 | -95.687 | -6.334 |
| -0.759999999999998 | 2.332 | -95.131 | -6.333 |
| -0.755999999999998 | 2.362 | -94.577 | -6.331 |
| -0.751999999999998 | 2.391 | -94.025 | -6.329 |
| -0.747999999999998 | 2.421 | -93.475 | -6.327 |
| -0.743999999999998 | 2.45 | -92.927 | -6.324 |
| -0.739999999999998 | 2.479 | -92.381 | -6.322 |
| -0.735999999999998 | 2.508 | -91.837 | -6.319 |
| -0.731999999999998 | 2.536 | -91.294 | -6.315 |
| -0.727999999999998 | 2.564 | -90.754 | -6.312 |
| -0.723999999999998 | 2.592 | -90.215 | -6.308 |
| -0.719999999999998 | 2.62 | -89.679 | -6.304 |
| -0.715999999999998 | 2.647 | -89.144 | -6.299 |
| -0.711999999999998 | 2.674 | -88.611 | -6.295 |
| -0.707999999999998 | 2.701 | -88.08 | -6.29 |
| -0.703999999999998 | 2.728 | -87.551 | -6.285 |
| -0.699999999999998 | 2.754 | -87.024 | -6.279 |
| -0.695999999999998 | 2.78 | -86.499 | -6.273 |
| -0.691999999999998 | 2.806 | -85.975 | -6.267 |
| -0.687999999999998 | 2.831 | -85.454 | -6.261 |
| -0.683999999999998 | 2.857 | -84.934 | -6.254 |
| -0.679999999999998 | 2.882 | -84.416 | -6.247 |
| -0.675999999999998 | 2.906 | -83.9 | -6.24 |
| -0.671999999999998 | 2.931 | -83.386 | -6.233 |
| -0.667999999999998 | 2.955 | -82.874 | -6.225 |
| -0.663999999999998 | 2.979 | -82.364 | -6.217 |
| -0.659999999999998 | 3.003 | -81.855 | -6.208 |
| -0.655999999999998 | 3.026 | -81.349 | -6.2 |
| -0.651999999999998 | 3.049 | -80.844 | -6.191 |
| -0.647999999999998 | 3.072 | -80.341 | -6.182 |
| -0.643999999999998 | 3.095 | -79.84 | -6.172 |
| -0.639999999999998 | 3.117 | -79.34 | -6.162 |
| -0.635999999999998 | 3.139 | -78.843 | -6.152 |
| -0.631999999999998 | 3.161 | -78.347 | -6.142 |
| -0.627999999999998 | 3.183 | -77.854 | -6.131 |
| -0.623999999999998 | 3.205 | -77.362 | -6.12 |
| -0.619999999999998 | 3.226 | -76.871 | -6.109 |
| -0.615999999999998 | 3.247 | -76.383 | -6.097 |
| -0.611999999999998 | 3.267 | -75.897 | -6.086 |
| -0.607999999999998 | 3.288 | -75.412 | -6.073 |
| -0.603999999999998 | 3.308 | -74.929 | -6.061 |
| -0.599999999999998 | 3.328 | -74.448 | -6.048 |
| -0.595999999999998 | 3.348 | -73.969 | -6.035 |
| -0.591999999999998 | 3.367 | -73.491 | -6.021 |
| -0.587999999999998 | 3.386 | -73.016 | -6.008 |
| -0.583999999999998 | 3.405 | -72.542 | -5.994 |
| -0.579999999999998 | 3.424 | -72.07 | -5.979 |
| -0.575999999999998 | 3.443 | -71.599 | -5.965 |
| -0.571999999999998 | 3.461 | -71.131 | -5.95 |
| -0.567999999999998 | 3.479 | -70.664 | -5.934 |
| -0.563999999999998 | 3.497 | -70.199 | -5.919 |
| -0.559999999999998 | 3.514 | -69.736 | -5.903 |
| -0.555999999999998 | 3.532 | -69.275 | -5.887 |
| -0.551999999999998 | 3.549 | -68.815 | -5.87 |
| -0.547999999999998 | 3.566 | -68.357 | -5.853 |
| -0.543999999999998 | 3.582 | -67.901 | -5.836 |
| -0.539999999999998 | 3.599 | -67.447 | -5.818 |
| -0.535999999999998 | 3.615 | -66.994 | -5.801 |
| -0.531999999999998 | 3.631 | -66.544 | -5.782 |
| -0.527999999999998 | 3.646 | -66.095 | -5.764 |
| -0.523999999999998 | 3.662 | -65.647 | -5.745 |
| -0.519999999999998 | 3.677 | -65.202 | -5.726 |
| -0.515999999999998 | 3.692 | -64.758 | -5.706 |
| -0.511999999999998 | 3.707 | -64.316 | -5.686 |
| -0.507999999999998 | 3.722 | -63.875 | -5.666 |
| -0.503999999999998 | 3.736 | -63.437 | -5.646 |
| -0.499999999999998 | 3.75 | -63 | -5.625 |
| -0.495999999999998 | 3.764 | -62.565 | -5.604 |
| -0.491999999999998 | 3.778 | -62.131 | -5.582 |
| -0.487999999999998 | 3.791 | -61.7 | -5.56 |
| -0.483999999999998 | 3.804 | -61.27 | -5.538 |
| -0.479999999999998 | 3.817 | -60.842 | -5.516 |
| -0.475999999999998 | 3.83 | -60.415 | -5.493 |
| -0.471999999999998 | 3.843 | -59.99 | -5.47 |
| -0.467999999999998 | 3.855 | -59.567 | -5.446 |
| -0.463999999999998 | 3.867 | -59.146 | -5.422 |
| -0.459999999999998 | 3.879 | -58.726 | -5.398 |
| -0.455999999999998 | 3.891 | -58.308 | -5.373 |
| -0.451999999999998 | 3.902 | -57.892 | -5.348 |
| -0.447999999999998 | 3.913 | -57.477 | -5.323 |
| -0.443999999999998 | 3.924 | -57.064 | -5.298 |
| -0.439999999999998 | 3.935 | -56.653 | -5.272 |
| -0.435999999999998 | 3.946 | -56.243 | -5.245 |
| -0.431999999999998 | 3.956 | -55.835 | -5.219 |
| -0.427999999999998 | 3.966 | -55.429 | -5.191 |
| -0.423999999999998 | 3.976 | -55.024 | -5.164 |
| -0.419999999999998 | 3.986 | -54.622 | -5.136 |
| -0.415999999999998 | 3.996 | -54.22 | -5.108 |
| -0.411999999999998 | 4.005 | -53.821 | -5.08 |
| -0.407999999999998 | 4.014 | -53.423 | -5.051 |
| -0.403999999999998 | 4.023 | -53.027 | -5.022 |
| -0.399999999999998 | 4.032 | -52.632 | -4.992 |
| -0.395999999999998 | 4.041 | -52.239 | -4.962 |
| -0.391999999999998 | 4.049 | -51.848 | -4.932 |
| -0.387999999999998 | 4.057 | -51.458 | -4.901 |
| -0.383999999999998 | 4.065 | -51.07 | -4.87 |
| -0.379999999999998 | 4.073 | -50.684 | -4.839 |
| -0.375999999999998 | 4.08 | -50.299 | -4.807 |
| -0.371999999999998 | 4.088 | -49.916 | -4.775 |
| -0.367999999999998 | 4.095 | -49.534 | -4.742 |
| -0.363999999999998 | 4.102 | -49.155 | -4.709 |
| -0.359999999999998 | 4.108 | -48.776 | -4.676 |
| -0.355999999999998 | 4.115 | -48.4 | -4.642 |
| -0.351999999999998 | 4.121 | -48.025 | -4.608 |
| -0.347999999999998 | 4.127 | -47.652 | -4.574 |
| -0.343999999999998 | 4.133 | -47.28 | -4.539 |
| -0.339999999999998 | 4.139 | -46.91 | -4.504 |
| -0.335999999999998 | 4.145 | -46.541 | -4.468 |
| -0.331999999999998 | 4.15 | -46.174 | -4.432 |
| -0.327999999999998 | 4.155 | -45.809 | -4.396 |
| -0.323999999999998 | 4.16 | -45.445 | -4.359 |
| -0.319999999999998 | 4.165 | -45.083 | -4.322 |
| -0.315999999999998 | 4.169 | -44.722 | -4.285 |
| -0.311999999999998 | 4.174 | -44.363 | -4.247 |
| -0.307999999999998 | 4.178 | -44.006 | -4.209 |
| -0.303999999999998 | 4.182 | -43.65 | -4.17 |
| -0.299999999999998 | 4.186 | -43.296 | -4.131 |
| -0.295999999999998 | 4.19 | -42.943 | -4.092 |
| -0.291999999999998 | 4.193 | -42.592 | -4.052 |
| -0.287999999999998 | 4.196 | -42.243 | -4.012 |
| -0.283999999999998 | 4.2 | -41.895 | -3.971 |
| -0.279999999999998 | 4.202 | -41.548 | -3.93 |
| -0.275999999999998 | 4.205 | -41.204 | -3.888 |
| -0.271999999999998 | 4.208 | -40.86 | -3.847 |
| -0.267999999999998 | 4.21 | -40.519 | -3.804 |
| -0.263999999999998 | 4.212 | -40.178 | -3.762 |
| -0.259999999999998 | 4.214 | -39.84 | -3.719 |
| -0.255999999999998 | 4.216 | -39.503 | -3.675 |
| -0.251999999999998 | 4.218 | -39.167 | -3.631 |
| -0.247999999999998 | 4.219 | -38.833 | -3.587 |
| -0.243999999999998 | 4.221 | -38.501 | -3.543 |
| -0.239999999999998 | 4.222 | -38.17 | -3.497 |
| -0.235999999999998 | 4.223 | -37.84 | -3.452 |
| -0.231999999999998 | 4.224 | -37.513 | -3.406 |
| -0.227999999999998 | 4.224 | -37.186 | -3.36 |
| -0.223999999999998 | 4.225 | -36.861 | -3.313 |
| -0.219999999999998 | 4.225 | -36.538 | -3.266 |
| -0.215999999999998 | 4.225 | -36.216 | -3.218 |
| -0.211999999999998 | 4.225 | -35.896 | -3.17 |
| -0.207999999999998 | 4.225 | -35.577 | -3.122 |
| -0.203999999999998 | 4.225 | -35.26 | -3.073 |
| -0.199999999999997 | 4.224 | -34.944 | -3.024 |
| -0.195999999999997 | 4.223 | -34.63 | -2.974 |
| -0.191999999999997 | 4.222 | -34.317 | -2.924 |
| -0.187999999999997 | 4.221 | -34.006 | -2.874 |
| -0.183999999999997 | 4.22 | -33.696 | -2.823 |
| -0.179999999999997 | 4.219 | -33.387 | -2.771 |
| -0.175999999999997 | 4.217 | -33.081 | -2.72 |
| -0.171999999999997 | 4.215 | -32.775 | -2.668 |
| -0.167999999999997 | 4.214 | -32.471 | -2.615 |
| -0.163999999999997 | 4.212 | -32.169 | -2.562 |
| -0.159999999999997 | 4.209 | -31.868 | -2.508 |
| -0.155999999999997 | 4.207 | -31.568 | -2.454 |
| -0.151999999999997 | 4.205 | -31.27 | -2.4 |
| -0.147999999999997 | 4.202 | -30.974 | -2.345 |
| -0.143999999999997 | 4.199 | -30.679 | -2.29 |
| -0.139999999999997 | 4.196 | -30.385 | -2.234 |
| -0.135999999999997 | 4.193 | -30.093 | -2.178 |
| -0.131999999999997 | 4.19 | -29.802 | -2.122 |
| -0.127999999999997 | 4.186 | -29.513 | -2.065 |
| -0.123999999999997 | 4.183 | -29.225 | -2.007 |
| -0.119999999999997 | 4.179 | -28.939 | -1.949 |
| -0.115999999999997 | 4.175 | -28.654 | -1.891 |
| -0.111999999999997 | 4.171 | -28.37 | -1.832 |
| -0.107999999999997 | 4.167 | -28.088 | -1.773 |
| -0.103999999999997 | 4.162 | -27.807 | -1.713 |
| -0.0999999999999974 | 4.158 | -27.528 | -1.653 |
| -0.0959999999999974 | 4.153 | -27.25 | -1.592 |
| -0.0919999999999974 | 4.149 | -26.974 | -1.531 |
| -0.0879999999999974 | 4.144 | -26.699 | -1.47 |
| -0.0839999999999974 | 4.139 | -26.425 | -1.408 |
| -0.0799999999999974 | 4.133 | -26.153 | -1.346 |
| -0.0759999999999974 | 4.128 | -25.882 | -1.283 |
| -0.0719999999999974 | 4.123 | -25.613 | -1.219 |
| -0.0679999999999974 | 4.117 | -25.345 | -1.156 |
| -0.0639999999999974 | 4.111 | -25.078 | -1.091 |
| -0.0599999999999974 | 4.105 | -24.813 | -1.027 |
| -0.0559999999999974 | 4.099 | -24.549 | -0.961 |
| -0.0519999999999974 | 4.093 | -24.287 | -0.896 |
| -0.0479999999999974 | 4.087 | -24.026 | -0.83 |
| -0.0439999999999974 | 4.08 | -23.766 | -0.763 |
| -0.0399999999999974 | 4.073 | -23.508 | -0.696 |
| -0.0359999999999974 | 4.067 | -23.251 | -0.629 |
| -0.0319999999999974 | 4.06 | -22.995 | -0.561 |
| -0.0279999999999974 | 4.053 | -22.741 | -0.492 |
| -0.0239999999999974 | 4.046 | -22.488 | -0.423 |
| -0.0199999999999974 | 4.038 | -22.237 | -0.354 |
| -0.0159999999999974 | 4.031 | -21.987 | -0.284 |
| -0.0119999999999974 | 4.023 | -21.738 | -0.214 |
| -0.00799999999999736 | 4.016 | -21.491 | -0.143 |
| -0.00399999999999736 | 4.008 | -21.245 | -0.072 |
| 2.63677968348475e-15 | 4 | -21 | 0 |
| 0.00400000000000264 | 3.992 | -20.757 | 0.072 |
| 0.00800000000000264 | 3.984 | -20.515 | 0.145 |
| 0.0120000000000026 | 3.975 | -20.274 | 0.218 |
| 0.0160000000000026 | 3.967 | -20.035 | 0.292 |
| 0.0200000000000026 | 3.958 | -19.797 | 0.366 |
| 0.0240000000000026 | 3.95 | -19.56 | 0.441 |
| 0.0280000000000026 | 3.941 | -19.325 | 0.516 |
| 0.0320000000000026 | 3.932 | -19.091 | 0.591 |
| 0.0360000000000026 | 3.923 | -18.858 | 0.668 |
| 0.0400000000000026 | 3.914 | -18.627 | 0.744 |
| 0.0440000000000026 | 3.904 | -18.397 | 0.821 |
| 0.0480000000000026 | 3.895 | -18.168 | 0.899 |
| 0.0520000000000026 | 3.885 | -17.94 | 0.977 |
| 0.0560000000000026 | 3.876 | -17.714 | 1.056 |
| 0.0600000000000027 | 3.866 | -17.489 | 1.135 |
| 0.0640000000000027 | 3.856 | -17.266 | 1.214 |
| 0.0680000000000027 | 3.846 | -17.044 | 1.294 |
| 0.0720000000000027 | 3.836 | -16.823 | 1.375 |
| 0.0760000000000027 | 3.826 | -16.603 | 1.456 |
| 0.0800000000000027 | 3.815 | -16.385 | 1.538 |
| 0.0840000000000027 | 3.805 | -16.168 | 1.62 |
| 0.0880000000000027 | 3.794 | -15.952 | 1.702 |
| 0.0920000000000027 | 3.784 | -15.737 | 1.785 |
| 0.0960000000000027 | 3.773 | -15.524 | 1.869 |
| 0.100000000000003 | 3.762 | -15.312 | 1.953 |
| 0.104000000000003 | 3.751 | -15.101 | 2.038 |
| 0.108000000000003 | 3.74 | -14.892 | 2.123 |
| 0.112000000000003 | 3.729 | -14.684 | 2.208 |
| 0.116000000000003 | 3.717 | -14.477 | 2.295 |
| 0.120000000000003 | 3.706 | -14.271 | 2.381 |
| 0.124000000000003 | 3.694 | -14.067 | 2.468 |
| 0.128000000000003 | 3.683 | -13.863 | 2.556 |
| 0.132000000000003 | 3.671 | -13.661 | 2.644 |
| 0.136000000000003 | 3.659 | -13.461 | 2.733 |
| 0.140000000000003 | 3.647 | -13.261 | 2.822 |
| 0.144000000000003 | 3.635 | -13.063 | 2.912 |
| 0.148000000000003 | 3.623 | -12.866 | 3.002 |
| 0.152000000000003 | 3.611 | -12.67 | 3.093 |
| 0.156000000000003 | 3.598 | -12.476 | 3.184 |
| 0.160000000000003 | 3.586 | -12.282 | 3.276 |
| 0.164000000000003 | 3.573 | -12.09 | 3.369 |
| 0.168000000000003 | 3.561 | -11.899 | 3.462 |
| 0.172000000000003 | 3.548 | -11.71 | 3.555 |
| 0.176000000000003 | 3.535 | -11.521 | 3.649 |
| 0.180000000000003 | 3.522 | -11.334 | 3.743 |
| 0.184000000000003 | 3.509 | -11.148 | 3.839 |
| 0.188000000000003 | 3.496 | -10.963 | 3.934 |
| 0.192000000000003 | 3.483 | -10.78 | 4.03 |
| 0.196000000000003 | 3.469 | -10.597 | 4.127 |
| 0.200000000000003 | 3.456 | -10.416 | 4.224 |
| 0.204000000000003 | 3.443 | -10.236 | 4.322 |
| 0.208000000000003 | 3.429 | -10.057 | 4.42 |
| 0.212000000000003 | 3.415 | -9.879 | 4.519 |
| 0.216000000000003 | 3.402 | -9.703 | 4.618 |
| 0.220000000000003 | 3.388 | -9.528 | 4.718 |
| 0.224000000000003 | 3.374 | -9.353 | 4.818 |
| 0.228000000000003 | 3.36 | -9.181 | 4.919 |
| 0.232000000000003 | 3.346 | -9.009 | 5.021 |
| 0.236000000000003 | 3.332 | -8.838 | 5.123 |
| 0.240000000000003 | 3.317 | -8.669 | 5.225 |
| 0.244000000000003 | 3.303 | -8.5 | 5.329 |
| 0.248000000000003 | 3.288 | -8.333 | 5.432 |
| 0.252000000000003 | 3.274 | -8.167 | 5.537 |
| 0.256000000000003 | 3.259 | -8.002 | 5.641 |
| 0.260000000000003 | 3.245 | -7.839 | 5.747 |
| 0.264000000000003 | 3.23 | -7.676 | 5.853 |
| 0.268000000000003 | 3.215 | -7.515 | 5.959 |
| 0.272000000000003 | 3.2 | -7.354 | 6.066 |
| 0.276000000000003 | 3.185 | -7.195 | 6.174 |
| 0.280000000000003 | 3.17 | -7.037 | 6.282 |
| 0.284000000000003 | 3.155 | -6.88 | 6.391 |
| 0.288000000000003 | 3.14 | -6.725 | 6.5 |
| 0.292000000000003 | 3.125 | -6.57 | 6.61 |
| 0.296000000000003 | 3.109 | -6.416 | 6.72 |
| 0.300000000000003 | 3.094 | -6.264 | 6.831 |
| 0.304000000000003 | 3.079 | -6.113 | 6.943 |
| 0.308000000000003 | 3.063 | -5.963 | 7.055 |
| 0.312000000000003 | 3.047 | -5.813 | 7.167 |
| 0.316000000000003 | 3.032 | -5.666 | 7.281 |
| 0.320000000000003 | 3.016 | -5.519 | 7.394 |
| 0.324000000000003 | 3 | -5.373 | 7.509 |
| 0.328000000000003 | 2.984 | -5.228 | 7.624 |
| 0.332000000000003 | 2.968 | -5.085 | 7.739 |
| 0.336000000000003 | 2.952 | -4.942 | 7.855 |
| 0.340000000000003 | 2.936 | -4.801 | 7.972 |
| 0.344000000000003 | 2.92 | -4.66 | 8.089 |
| 0.348000000000003 | 2.904 | -4.521 | 8.207 |
| 0.352000000000003 | 2.888 | -4.383 | 8.325 |
| 0.356000000000003 | 2.871 | -4.246 | 8.444 |
| 0.360000000000003 | 2.855 | -4.11 | 8.564 |
| 0.364000000000003 | 2.838 | -3.975 | 8.684 |
| 0.368000000000003 | 2.822 | -3.841 | 8.805 |
| 0.372000000000003 | 2.805 | -3.708 | 8.926 |
| 0.376000000000003 | 2.789 | -3.577 | 9.048 |
| 0.380000000000003 | 2.772 | -3.446 | 9.171 |
| 0.384000000000003 | 2.755 | -3.316 | 9.294 |
| 0.388000000000003 | 2.739 | -3.188 | 9.417 |
| 0.392000000000003 | 2.722 | -3.06 | 9.542 |
| 0.396000000000003 | 2.705 | -2.933 | 9.667 |
| 0.400000000000003 | 2.688 | -2.808 | 9.792 |
| 0.404000000000003 | 2.671 | -2.684 | 9.918 |
| 0.408000000000003 | 2.654 | -2.56 | 10.045 |
| 0.412000000000003 | 2.637 | -2.438 | 10.172 |
| 0.416000000000003 | 2.62 | -2.316 | 10.3 |
| 0.420000000000003 | 2.603 | -2.196 | 10.428 |
| 0.424000000000003 | 2.585 | -2.077 | 10.557 |
| 0.428000000000003 | 2.568 | -1.959 | 10.687 |
| 0.432000000000003 | 2.551 | -1.841 | 10.817 |
| 0.436000000000003 | 2.533 | -1.725 | 10.948 |
| 0.440000000000003 | 2.516 | -1.61 | 11.08 |
| 0.444000000000003 | 2.499 | -1.495 | 11.212 |
| 0.448000000000003 | 2.481 | -1.382 | 11.344 |
| 0.452000000000003 | 2.463 | -1.27 | 11.478 |
| 0.456000000000003 | 2.446 | -1.159 | 11.611 |
| 0.460000000000003 | 2.428 | -1.049 | 11.746 |
| 0.464000000000003 | 2.411 | -0.939 | 11.881 |
| 0.468000000000003 | 2.393 | -0.831 | 12.017 |
| 0.472000000000003 | 2.375 | -0.724 | 12.153 |
| 0.476000000000003 | 2.357 | -0.617 | 12.29 |
| 0.480000000000003 | 2.34 | -0.512 | 12.428 |
| 0.484000000000003 | 2.322 | -0.408 | 12.566 |
| 0.488000000000003 | 2.304 | -0.304 | 12.705 |
| 0.492000000000003 | 2.286 | -0.202 | 12.844 |
| 0.496000000000003 | 2.268 | -0.1 | 12.984 |
| 0.500000000000003 | 2.25 | 0 | 13.125 |
| 0.504000000000003 | 2.232 | 0.1 | 13.266 |
| 0.508000000000003 | 2.214 | 0.198 | 13.408 |
| 0.512000000000003 | 2.196 | 0.296 | 13.551 |
| 0.516000000000003 | 2.178 | 0.392 | 13.694 |
| 0.520000000000003 | 2.16 | 0.488 | 13.838 |
| 0.524000000000003 | 2.141 | 0.583 | 13.982 |
| 0.528000000000003 | 2.123 | 0.677 | 14.127 |
| 0.532000000000003 | 2.105 | 0.77 | 14.273 |
| 0.536000000000003 | 2.087 | 0.861 | 14.419 |
| 0.540000000000003 | 2.069 | 0.953 | 14.566 |
| 0.544000000000003 | 2.05 | 1.043 | 14.714 |
| 0.548000000000003 | 2.032 | 1.132 | 14.862 |
| 0.552000000000003 | 2.014 | 1.22 | 15.011 |
| 0.556000000000003 | 1.995 | 1.307 | 15.161 |
| 0.560000000000003 | 1.977 | 1.394 | 15.311 |
| 0.564000000000003 | 1.958 | 1.479 | 15.462 |
| 0.568000000000003 | 1.94 | 1.564 | 15.613 |
| 0.572000000000003 | 1.922 | 1.647 | 15.765 |
| 0.576000000000003 | 1.903 | 1.73 | 15.918 |
| 0.580000000000003 | 1.885 | 1.812 | 16.071 |
| 0.584000000000003 | 1.866 | 1.893 | 16.225 |
| 0.588000000000003 | 1.848 | 1.973 | 16.38 |
| 0.592000000000003 | 1.829 | 2.052 | 16.535 |
| 0.596000000000003 | 1.811 | 2.131 | 16.691 |
| 0.600000000000003 | 1.792 | 2.208 | 16.848 |
| 0.604000000000003 | 1.773 | 2.285 | 17.005 |
| 0.608000000000003 | 1.755 | 2.36 | 17.163 |
| 0.612000000000003 | 1.736 | 2.435 | 17.322 |
| 0.616000000000003 | 1.718 | 2.509 | 17.481 |
| 0.620000000000003 | 1.699 | 2.582 | 17.641 |
| 0.624000000000003 | 1.68 | 2.654 | 17.802 |
| 0.628000000000003 | 1.662 | 2.725 | 17.963 |
| 0.632000000000003 | 1.643 | 2.796 | 18.125 |
| 0.636000000000003 | 1.625 | 2.865 | 18.287 |
| 0.640000000000003 | 1.606 | 2.934 | 18.45 |
| 0.644000000000003 | 1.587 | 3.002 | 18.614 |
| 0.648000000000003 | 1.569 | 3.069 | 18.779 |
| 0.652000000000003 | 1.55 | 3.135 | 18.944 |
| 0.656000000000003 | 1.531 | 3.2 | 19.11 |
| 0.660000000000003 | 1.513 | 3.265 | 19.276 |
| 0.664000000000003 | 1.494 | 3.328 | 19.444 |
| 0.668000000000003 | 1.475 | 3.391 | 19.612 |
| 0.672000000000003 | 1.457 | 3.453 | 19.78 |
| 0.676000000000003 | 1.438 | 3.514 | 19.949 |
| 0.680000000000003 | 1.419 | 3.575 | 20.119 |
| 0.684000000000003 | 1.401 | 3.634 | 20.29 |
| 0.688000000000003 | 1.382 | 3.693 | 20.461 |
| 0.692000000000003 | 1.363 | 3.751 | 20.633 |
| 0.696000000000003 | 1.345 | 3.808 | 20.806 |
| 0.700000000000003 | 1.326 | 3.864 | 20.979 |
| 0.704000000000003 | 1.307 | 3.919 | 21.153 |
| 0.708000000000003 | 1.289 | 3.974 | 21.328 |
| 0.712000000000003 | 1.27 | 4.028 | 21.503 |
| 0.716000000000003 | 1.251 | 4.081 | 21.679 |
| 0.720000000000003 | 1.233 | 4.133 | 21.856 |
| 0.724000000000003 | 1.214 | 4.185 | 22.033 |
| 0.728000000000003 | 1.196 | 4.235 | 22.211 |
| 0.732000000000003 | 1.177 | 4.285 | 22.39 |
| 0.736000000000003 | 1.159 | 4.334 | 22.57 |
| 0.740000000000003 | 1.14 | 4.383 | 22.75 |
| 0.744000000000003 | 1.122 | 4.43 | 22.931 |
| 0.748000000000003 | 1.103 | 4.477 | 23.112 |
| 0.752000000000003 | 1.085 | 4.523 | 23.294 |
| 0.756000000000003 | 1.066 | 4.568 | 23.477 |
| 0.760000000000003 | 1.048 | 4.613 | 23.661 |
| 0.764000000000003 | 1.029 | 4.656 | 23.845 |
| 0.768000000000003 | 1.011 | 4.699 | 24.03 |
| 0.772000000000003 | 0.992 | 4.741 | 24.216 |
| 0.776000000000003 | 0.974 | 4.783 | 24.403 |
| 0.780000000000003 | 0.956 | 4.824 | 24.59 |
| 0.784000000000003 | 0.937 | 4.864 | 24.778 |
| 0.788000000000003 | 0.919 | 4.903 | 24.966 |
| 0.792000000000003 | 0.901 | 4.941 | 25.155 |
| 0.796000000000003 | 0.882 | 4.979 | 25.345 |
| 0.800000000000003 | 0.864 | 5.016 | 25.536 |
| 0.804000000000003 | 0.846 | 5.052 | 25.727 |
| 0.808000000000003 | 0.828 | 5.088 | 25.92 |
| 0.812000000000003 | 0.809 | 5.123 | 26.112 |
| 0.816000000000003 | 0.791 | 5.157 | 26.306 |
| 0.820000000000003 | 0.773 | 5.19 | 26.5 |
| 0.824000000000003 | 0.755 | 5.223 | 26.695 |
| 0.828000000000003 | 0.737 | 5.255 | 26.891 |
| 0.832000000000003 | 0.719 | 5.286 | 27.087 |
| 0.836000000000003 | 0.701 | 5.317 | 27.284 |
| 0.840000000000003 | 0.683 | 5.346 | 27.482 |
| 0.844000000000003 | 0.665 | 5.376 | 27.681 |
| 0.848000000000003 | 0.647 | 5.404 | 27.88 |
| 0.852000000000003 | 0.629 | 5.432 | 28.08 |
| 0.856000000000003 | 0.612 | 5.459 | 28.281 |
| 0.860000000000003 | 0.594 | 5.485 | 28.482 |
| 0.864000000000003 | 0.576 | 5.511 | 28.684 |
| 0.868000000000003 | 0.558 | 5.536 | 28.887 |
| 0.872000000000003 | 0.541 | 5.56 | 29.091 |
| 0.876000000000003 | 0.523 | 5.584 | 29.295 |
| 0.880000000000003 | 0.505 | 5.607 | 29.5 |
| 0.884000000000003 | 0.488 | 5.629 | 29.706 |
| 0.888000000000003 | 0.47 | 5.651 | 29.913 |
| 0.892000000000003 | 0.453 | 5.672 | 30.12 |
| 0.896000000000003 | 0.435 | 5.692 | 30.328 |
| 0.900000000000003 | 0.418 | 5.712 | 30.537 |
| 0.904000000000003 | 0.401 | 5.731 | 30.747 |
| 0.908000000000003 | 0.383 | 5.749 | 30.957 |
| 0.912000000000003 | 0.366 | 5.767 | 31.168 |
| 0.916000000000003 | 0.349 | 5.784 | 31.38 |
| 0.920000000000003 | 0.332 | 5.801 | 31.592 |
| 0.924000000000003 | 0.315 | 5.817 | 31.805 |
| 0.928000000000003 | 0.298 | 5.832 | 32.019 |
| 0.932000000000003 | 0.281 | 5.846 | 32.234 |
| 0.936000000000003 | 0.264 | 5.86 | 32.45 |
| 0.940000000000003 | 0.247 | 5.873 | 32.666 |
| 0.944000000000003 | 0.23 | 5.886 | 32.883 |
| 0.948000000000003 | 0.213 | 5.898 | 33.1 |
| 0.952000000000003 | 0.196 | 5.91 | 33.319 |
| 0.956000000000003 | 0.18 | 5.92 | 33.538 |
| 0.960000000000003 | 0.163 | 5.931 | 33.758 |
| 0.964000000000003 | 0.146 | 5.94 | 33.979 |
| 0.968000000000003 | 0.13 | 5.949 | 34.2 |
| 0.972000000000003 | 0.114 | 5.958 | 34.423 |
| 0.976000000000003 | 0.097 | 5.966 | 34.646 |
| 0.980000000000003 | 0.081 | 5.973 | 34.87 |
| 0.984000000000003 | 0.065 | 5.979 | 35.094 |
| 0.988000000000003 | 0.048 | 5.985 | 35.319 |
| 0.992000000000003 | 0.032 | 5.991 | 35.546 |
| 0.996000000000003 | 0.016 | 5.996 | 35.772 |
| 1.000000000000003 | 0 | 6 | 36 |
| 1.004000000000003 | -0.016 | 6.004 | 36.228 |
| 1.008000000000003 | -0.032 | 6.007 | 36.458 |
| 1.012000000000003 | -0.048 | 6.009 | 36.687 |
| 1.016000000000003 | -0.063 | 6.011 | 36.918 |
| 1.020000000000003 | -0.079 | 6.013 | 37.15 |
| 1.024000000000003 | -0.095 | 6.014 | 37.382 |
| 1.028000000000003 | -0.11 | 6.014 | 37.615 |
| 1.032000000000003 | -0.126 | 6.014 | 37.849 |
| 1.036000000000003 | -0.141 | 6.013 | 38.083 |
| 1.040000000000003 | -0.157 | 6.012 | 38.319 |
| 1.044000000000003 | -0.172 | 6.01 | 38.555 |
| 1.048000000000003 | -0.187 | 6.007 | 38.792 |
| 1.052000000000003 | -0.202 | 6.004 | 39.029 |
| 1.056000000000003 | -0.217 | 6.001 | 39.268 |
| 1.060000000000003 | -0.232 | 5.997 | 39.507 |
| 1.064000000000003 | -0.247 | 5.992 | 39.747 |
| 1.068000000000003 | -0.262 | 5.987 | 39.988 |
| 1.072000000000003 | -0.277 | 5.982 | 40.23 |
| 1.076000000000003 | -0.292 | 5.976 | 40.472 |
| 1.080000000000003 | -0.306 | 5.969 | 40.715 |
| 1.084000000000003 | -0.321 | 5.962 | 40.959 |
| 1.088000000000003 | -0.335 | 5.954 | 41.204 |
| 1.092000000000003 | -0.35 | 5.946 | 41.449 |
| 1.096000000000003 | -0.364 | 5.937 | 41.696 |
| 1.100000000000003 | -0.378 | 5.928 | 41.943 |
| 1.104000000000003 | -0.392 | 5.918 | 42.191 |
| 1.108000000000003 | -0.406 | 5.908 | 42.44 |
| 1.112000000000003 | -0.42 | 5.897 | 42.689 |
| 1.116000000000003 | -0.434 | 5.886 | 42.94 |
| 1.120000000000003 | -0.448 | 5.875 | 43.191 |
| 1.124000000000003 | -0.461 | 5.862 | 43.443 |
| 1.128000000000003 | -0.475 | 5.85 | 43.696 |
| 1.132000000000003 | -0.489 | 5.837 | 43.949 |
| 1.136000000000003 | -0.502 | 5.823 | 44.203 |
| 1.140000000000003 | -0.515 | 5.809 | 44.459 |
| 1.144000000000003 | -0.529 | 5.795 | 44.715 |
| 1.148000000000003 | -0.542 | 5.78 | 44.971 |
| 1.152000000000003 | -0.555 | 5.764 | 45.229 |
| 1.156000000000003 | -0.568 | 5.748 | 45.487 |
| 1.160000000000003 | -0.581 | 5.732 | 45.747 |
| 1.164000000000003 | -0.593 | 5.715 | 46.007 |
| 1.168000000000003 | -0.606 | 5.698 | 46.268 |
| 1.172000000000003 | -0.619 | 5.68 | 46.529 |
| 1.176000000000003 | -0.631 | 5.662 | 46.792 |
| 1.180000000000003 | -0.644 | 5.643 | 47.055 |
| 1.184000000000003 | -0.656 | 5.624 | 47.319 |
| 1.188000000000003 | -0.668 | 5.605 | 47.584 |
| 1.192000000000003 | -0.68 | 5.585 | 47.85 |
| 1.196000000000003 | -0.692 | 5.565 | 48.117 |
| 1.200000000000003 | -0.704 | 5.544 | 48.384 |
| 1.204000000000003 | -0.716 | 5.523 | 48.652 |
| 1.208000000000004 | -0.727 | 5.501 | 48.921 |
| 1.212000000000004 | -0.739 | 5.479 | 49.191 |
| 1.216000000000004 | -0.751 | 5.457 | 49.462 |
| 1.220000000000004 | -0.762 | 5.434 | 49.734 |
| 1.224000000000004 | -0.773 | 5.411 | 50.006 |
| 1.228000000000004 | -0.784 | 5.387 | 50.279 |
| 1.232000000000004 | -0.795 | 5.363 | 50.553 |
| 1.236000000000004 | -0.806 | 5.339 | 50.828 |
| 1.240000000000004 | -0.817 | 5.314 | 51.104 |
| 1.244000000000004 | -0.828 | 5.289 | 51.38 |
| 1.248000000000004 | -0.838 | 5.263 | 51.658 |
| 1.252000000000004 | -0.849 | 5.237 | 51.936 |
| 1.256000000000004 | -0.859 | 5.211 | 52.215 |
| 1.260000000000004 | -0.87 | 5.184 | 52.495 |
| 1.264000000000004 | -0.88 | 5.157 | 52.776 |
| 1.268000000000004 | -0.89 | 5.129 | 53.058 |
| 1.272000000000004 | -0.9 | 5.101 | 53.34 |
| 1.276000000000004 | -0.91 | 5.073 | 53.623 |
| 1.280000000000004 | -0.919 | 5.044 | 53.907 |
| 1.284000000000004 | -0.929 | 5.015 | 54.192 |
| 1.288000000000004 | -0.938 | 4.986 | 54.478 |
| 1.292000000000004 | -0.948 | 4.956 | 54.765 |
| 1.296000000000004 | -0.957 | 4.926 | 55.053 |
| 1.300000000000004 | -0.966 | 4.896 | 55.341 |
| 1.304000000000004 | -0.975 | 4.865 | 55.63 |
| 1.308000000000004 | -0.984 | 4.834 | 55.92 |
| 1.312000000000004 | -0.993 | 4.803 | 56.211 |
| 1.316000000000004 | -1.001 | 4.771 | 56.503 |
| 1.320000000000004 | -1.01 | 4.739 | 56.796 |
| 1.324000000000004 | -1.018 | 4.707 | 57.089 |
| 1.328000000000004 | -1.026 | 4.674 | 57.384 |
| 1.332000000000004 | -1.034 | 4.641 | 57.679 |
| 1.336000000000004 | -1.042 | 4.607 | 57.975 |
| 1.340000000000004 | -1.05 | 4.574 | 58.272 |
| 1.344000000000004 | -1.058 | 4.54 | 58.57 |
| 1.348000000000004 | -1.066 | 4.505 | 58.869 |
| 1.352000000000004 | -1.073 | 4.471 | 59.169 |
| 1.356000000000004 | -1.08 | 4.436 | 59.469 |
| 1.360000000000004 | -1.087 | 4.4 | 59.77 |
| 1.364000000000004 | -1.095 | 4.365 | 60.073 |
| 1.368000000000004 | -1.101 | 4.329 | 60.376 |
| 1.372000000000004 | -1.108 | 4.293 | 60.68 |
| 1.376000000000004 | -1.115 | 4.256 | 60.984 |
| 1.380000000000004 | -1.121 | 4.22 | 61.29 |
| 1.384000000000004 | -1.128 | 4.183 | 61.597 |
| 1.388000000000004 | -1.134 | 4.145 | 61.904 |
| 1.392000000000004 | -1.14 | 4.108 | 62.213 |
| 1.396000000000004 | -1.146 | 4.07 | 62.522 |
| 1.400000000000004 | -1.152 | 4.032 | 62.832 |
| 1.404000000000004 | -1.158 | 3.994 | 63.143 |
| 1.408000000000004 | -1.163 | 3.955 | 63.455 |
| 1.412000000000004 | -1.169 | 3.916 | 63.768 |
| 1.416000000000004 | -1.174 | 3.877 | 64.081 |
| 1.420000000000004 | -1.179 | 3.838 | 64.396 |
| 1.424000000000004 | -1.184 | 3.798 | 64.711 |
| 1.428000000000004 | -1.189 | 3.758 | 65.028 |
| 1.432000000000004 | -1.194 | 3.718 | 65.345 |
| 1.436000000000004 | -1.198 | 3.677 | 65.663 |
| 1.440000000000004 | -1.202 | 3.637 | 65.982 |
| 1.444000000000004 | -1.207 | 3.596 | 66.302 |
| 1.448000000000004 | -1.211 | 3.555 | 66.623 |
| 1.452000000000004 | -1.215 | 3.513 | 66.944 |
| 1.456000000000004 | -1.218 | 3.472 | 67.267 |
| 1.460000000000004 | -1.222 | 3.43 | 67.59 |
| 1.464000000000004 | -1.226 | 3.388 | 67.915 |
| 1.468000000000004 | -1.229 | 3.346 | 68.24 |
| 1.472000000000004 | -1.232 | 3.303 | 68.566 |
| 1.476000000000004 | -1.235 | 3.26 | 68.893 |
| 1.480000000000004 | -1.238 | 3.218 | 69.221 |
| 1.484000000000004 | -1.241 | 3.174 | 69.55 |
| 1.488000000000004 | -1.243 | 3.131 | 69.88 |
| 1.492000000000004 | -1.246 | 3.088 | 70.211 |
| 1.496000000000004 | -1.248 | 3.044 | 70.542 |
| 1.500000000000004 | -1.25 | 3 | 70.875 |
| 1.504000000000004 | -1.252 | 2.956 | 71.208 |
| 1.508000000000004 | -1.254 | 2.912 | 71.543 |
| 1.512000000000004 | -1.255 | 2.867 | 71.878 |
| 1.516000000000004 | -1.257 | 2.822 | 72.214 |
| 1.520000000000004 | -1.258 | 2.778 | 72.551 |
| 1.524000000000004 | -1.259 | 2.733 | 72.889 |
| 1.528000000000004 | -1.26 | 2.687 | 73.228 |
| 1.532000000000004 | -1.261 | 2.642 | 73.568 |
| 1.536000000000004 | -1.261 | 2.597 | 73.909 |
| 1.540000000000004 | -1.262 | 2.551 | 74.251 |
| 1.544000000000004 | -1.262 | 2.505 | 74.593 |
| 1.548000000000004 | -1.262 | 2.459 | 74.937 |
| 1.552000000000004 | -1.262 | 2.413 | 75.281 |
| 1.556000000000004 | -1.262 | 2.367 | 75.627 |
| 1.560000000000004 | -1.262 | 2.32 | 75.973 |
| 1.564000000000004 | -1.261 | 2.274 | 76.321 |
| 1.568000000000004 | -1.26 | 2.227 | 76.669 |
| 1.572000000000004 | -1.259 | 2.18 | 77.018 |
| 1.576000000000004 | -1.258 | 2.133 | 77.368 |
| 1.580000000000004 | -1.257 | 2.086 | 77.719 |
| 1.584000000000004 | -1.256 | 2.038 | 78.071 |
| 1.588000000000004 | -1.254 | 1.991 | 78.424 |
| 1.592000000000004 | -1.252 | 1.943 | 78.778 |
| 1.596000000000004 | -1.25 | 1.896 | 79.132 |
| 1.600000000000004 | -1.248 | 1.848 | 79.488 |
| 1.604000000000004 | -1.246 | 1.8 | 79.845 |
| 1.608000000000004 | -1.243 | 1.752 | 80.202 |
| 1.612000000000004 | -1.24 | 1.704 | 80.561 |
| 1.616000000000004 | -1.238 | 1.656 | 80.92 |
| 1.620000000000004 | -1.235 | 1.607 | 81.281 |
| 1.624000000000004 | -1.231 | 1.559 | 81.642 |
| 1.628000000000004 | -1.228 | 1.51 | 82.004 |
| 1.632000000000004 | -1.224 | 1.462 | 82.367 |
| 1.636000000000004 | -1.22 | 1.413 | 82.732 |
| 1.640000000000004 | -1.217 | 1.364 | 83.097 |
| 1.644000000000004 | -1.212 | 1.315 | 83.463 |
| 1.648000000000004 | -1.208 | 1.267 | 83.83 |
| 1.652000000000004 | -1.203 | 1.217 | 84.198 |
| 1.656000000000004 | -1.199 | 1.168 | 84.567 |
| 1.660000000000004 | -1.194 | 1.119 | 84.937 |
| 1.664000000000004 | -1.189 | 1.07 | 85.308 |
| 1.668000000000004 | -1.183 | 1.021 | 85.68 |
| 1.672000000000004 | -1.178 | 0.971 | 86.052 |
| 1.676000000000004 | -1.172 | 0.922 | 86.426 |
| 1.680000000000004 | -1.166 | 0.872 | 86.801 |
| 1.684000000000004 | -1.16 | 0.823 | 87.177 |
| 1.688000000000004 | -1.154 | 0.773 | 87.553 |
| 1.692000000000004 | -1.148 | 0.723 | 87.931 |
| 1.696000000000004 | -1.141 | 0.674 | 88.309 |
| 1.700000000000004 | -1.134 | 0.624 | 88.689 |
| 1.704000000000004 | -1.127 | 0.574 | 89.07 |
| 1.708000000000004 | -1.12 | 0.524 | 89.451 |
| 1.712000000000004 | -1.112 | 0.475 | 89.833 |
| 1.716000000000004 | -1.105 | 0.425 | 90.217 |
| 1.720000000000004 | -1.097 | 0.375 | 90.601 |
| 1.724000000000004 | -1.089 | 0.325 | 90.987 |
| 1.728000000000004 | -1.08 | 0.275 | 91.373 |
| 1.732000000000004 | -1.072 | 0.225 | 91.76 |
| 1.736000000000004 | -1.063 | 0.175 | 92.149 |
| 1.740000000000004 | -1.054 | 0.125 | 92.538 |
| 1.744000000000004 | -1.045 | 0.075 | 92.928 |
| 1.748000000000004 | -1.036 | 0.025 | 93.32 |
| 1.752000000000004 | -1.026 | -0.025 | 93.712 |
| 1.756000000000004 | -1.017 | -0.075 | 94.105 |
| 1.760000000000004 | -1.007 | -0.125 | 94.499 |
| 1.764000000000004 | -0.997 | -0.175 | 94.895 |
| 1.768000000000004 | -0.986 | -0.225 | 95.291 |
| 1.772000000000004 | -0.976 | -0.275 | 95.688 |
| 1.776000000000004 | -0.965 | -0.325 | 96.086 |
| 1.780000000000004 | -0.954 | -0.375 | 96.485 |
| 1.784000000000004 | -0.943 | -0.425 | 96.885 |
| 1.788000000000004 | -0.932 | -0.475 | 97.287 |
| 1.792000000000004 | -0.92 | -0.524 | 97.689 |
| 1.796000000000004 | -0.908 | -0.574 | 98.092 |
| 1.800000000000004 | -0.896 | -0.624 | 98.496 |
| 1.804000000000004 | -0.884 | -0.674 | 98.901 |
| 1.808000000000004 | -0.871 | -0.723 | 99.307 |
| 1.812000000000004 | -0.859 | -0.773 | 99.714 |
| 1.816000000000004 | -0.846 | -0.823 | 100.123 |
| 1.820000000000004 | -0.832 | -0.872 | 100.532 |
| 1.824000000000004 | -0.819 | -0.922 | 100.942 |
| 1.828000000000004 | -0.806 | -0.971 | 101.353 |
| 1.832000000000004 | -0.792 | -1.021 | 101.765 |
| 1.836000000000004 | -0.778 | -1.07 | 102.178 |
| 1.840000000000004 | -0.763 | -1.119 | 102.593 |
| 1.844000000000004 | -0.749 | -1.168 | 103.008 |
| 1.848000000000004 | -0.734 | -1.217 | 103.424 |
| 1.852000000000004 | -0.719 | -1.267 | 103.841 |
| 1.856000000000004 | -0.704 | -1.315 | 104.259 |
| 1.860000000000004 | -0.689 | -1.364 | 104.679 |
| 1.864000000000004 | -0.673 | -1.413 | 105.099 |
| 1.868000000000004 | -0.657 | -1.462 | 105.52 |
| 1.872000000000004 | -0.641 | -1.51 | 105.942 |
| 1.876000000000004 | -0.625 | -1.559 | 106.366 |
| 1.880000000000004 | -0.608 | -1.607 | 106.79 |
| 1.884000000000004 | -0.591 | -1.656 | 107.215 |
| 1.888000000000004 | -0.574 | -1.704 | 107.642 |
| 1.892000000000004 | -0.557 | -1.752 | 108.069 |
| 1.896000000000004 | -0.54 | -1.8 | 108.498 |
| 1.900000000000004 | -0.522 | -1.848 | 108.927 |
| 1.904000000000004 | -0.504 | -1.896 | 109.357 |
| 1.908000000000004 | -0.486 | -1.943 | 109.789 |
| 1.912000000000004 | -0.467 | -1.991 | 110.222 |
| 1.916000000000004 | -0.449 | -2.038 | 110.655 |
| 1.920000000000004 | -0.43 | -2.086 | 111.09 |
| 1.924000000000004 | -0.411 | -2.133 | 111.525 |
| 1.928000000000004 | -0.391 | -2.18 | 111.962 |
| 1.932000000000004 | -0.372 | -2.227 | 112.4 |
| 1.936000000000004 | -0.352 | -2.274 | 112.838 |
| 1.940000000000004 | -0.332 | -2.32 | 113.278 |
| 1.944000000000004 | -0.311 | -2.367 | 113.719 |
| 1.948000000000004 | -0.291 | -2.413 | 114.161 |
| 1.952000000000004 | -0.27 | -2.459 | 114.604 |
| 1.956000000000004 | -0.249 | -2.505 | 115.048 |
| 1.960000000000004 | -0.227 | -2.551 | 115.493 |
| 1.964000000000004 | -0.206 | -2.597 | 115.939 |
| 1.968000000000004 | -0.184 | -2.642 | 116.386 |
| 1.972000000000004 | -0.162 | -2.687 | 116.834 |
| 1.976000000000004 | -0.139 | -2.733 | 117.283 |
| 1.980000000000004 | -0.117 | -2.778 | 117.733 |
| 1.984000000000004 | -0.094 | -2.822 | 118.184 |
| 1.988000000000004 | -0.071 | -2.867 | 118.637 |
| 1.992000000000004 | -0.047 | -2.912 | 119.09 |
| 1.996000000000004 | -0.024 | -2.956 | 119.545 |
| 2.000000000000004 | 0 | -3 | 120 |
| 2.004000000000004 | 0.024 | -3.044 | 120.457 |
| 2.008000000000004 | 0.049 | -3.088 | 120.914 |
| 2.012000000000004 | 0.073 | -3.131 | 121.373 |
| 2.016000000000004 | 0.098 | -3.174 | 121.832 |
| 2.020000000000004 | 0.123 | -3.218 | 122.293 |
| 2.024000000000004 | 0.149 | -3.26 | 122.755 |
| 2.028000000000004 | 0.174 | -3.303 | 123.218 |
| 2.032000000000004 | 0.2 | -3.346 | 123.682 |
| 2.036000000000004 | 0.226 | -3.388 | 124.147 |
| 2.040000000000004 | 0.253 | -3.43 | 124.613 |
| 2.044000000000004 | 0.28 | -3.472 | 125.08 |
| 2.048000000000004 | 0.307 | -3.513 | 125.548 |
| 2.052000000000004 | 0.334 | -3.555 | 126.018 |
| 2.056000000000004 | 0.361 | -3.596 | 126.488 |
| 2.060000000000004 | 0.389 | -3.637 | 126.959 |
| 2.064000000000004 | 0.417 | -3.677 | 127.432 |
| 2.068000000000004 | 0.446 | -3.718 | 127.906 |
| 2.072000000000004 | 0.474 | -3.758 | 128.38 |
| 2.076000000000004 | 0.503 | -3.798 | 128.856 |
| 2.080000000000004 | 0.532 | -3.838 | 129.333 |
| 2.084000000000004 | 0.562 | -3.877 | 129.811 |
| 2.088000000000004 | 0.591 | -3.916 | 130.29 |
| 2.092000000000004 | 0.621 | -3.955 | 130.77 |
| 2.096000000000004 | 0.651 | -3.994 | 131.251 |
| 2.100000000000004 | 0.682 | -4.032 | 131.733 |
| 2.104000000000004 | 0.713 | -4.07 | 132.216 |
| 2.108000000000004 | 0.744 | -4.108 | 132.701 |
| 2.112000000000004 | 0.775 | -4.145 | 133.186 |
| 2.116000000000004 | 0.807 | -4.183 | 133.673 |
| 2.120000000000004 | 0.839 | -4.22 | 134.16 |
| 2.124000000000004 | 0.871 | -4.256 | 134.649 |
| 2.128000000000004 | 0.903 | -4.293 | 135.139 |
| 2.132000000000004 | 0.936 | -4.329 | 135.63 |
| 2.136000000000004 | 0.969 | -4.365 | 136.122 |
| 2.140000000000004 | 1.002 | -4.4 | 136.615 |
| 2.144000000000004 | 1.036 | -4.436 | 137.109 |
| 2.148000000000004 | 1.07 | -4.471 | 137.605 |
| 2.152000000000004 | 1.104 | -4.505 | 138.101 |
| 2.156000000000004 | 1.138 | -4.54 | 138.598 |
| 2.160000000000004 | 1.173 | -4.574 | 139.097 |
| 2.164000000000004 | 1.208 | -4.607 | 139.597 |
| 2.168000000000004 | 1.243 | -4.641 | 140.098 |
| 2.172000000000004 | 1.279 | -4.674 | 140.6 |
| 2.176000000000004 | 1.315 | -4.707 | 141.103 |
| 2.180000000000004 | 1.351 | -4.739 | 141.607 |
| 2.184000000000004 | 1.387 | -4.771 | 142.112 |
| 2.188000000000004 | 1.424 | -4.803 | 142.618 |
| 2.192000000000004 | 1.461 | -4.834 | 143.126 |
| 2.196000000000004 | 1.498 | -4.865 | 143.634 |
| 2.200000000000004 | 1.536 | -4.896 | 144.144 |
| 2.204000000000004 | 1.574 | -4.926 | 144.655 |
| 2.208000000000004 | 1.612 | -4.956 | 145.167 |
| 2.212000000000004 | 1.651 | -4.986 | 145.68 |
| 2.216000000000004 | 1.689 | -5.015 | 146.194 |
| 2.220000000000004 | 1.728 | -5.044 | 146.709 |
| 2.224000000000004 | 1.768 | -5.073 | 147.226 |
| 2.228000000000004 | 1.808 | -5.101 | 147.743 |
| 2.232000000000004 | 1.848 | -5.129 | 148.262 |
| 2.236000000000004 | 1.888 | -5.157 | 148.781 |
| 2.240000000000004 | 1.928 | -5.184 | 149.302 |
| 2.244000000000004 | 1.969 | -5.211 | 149.824 |
| 2.248000000000004 | 2.011 | -5.237 | 150.347 |
| 2.252000000000004 | 2.052 | -5.263 | 150.872 |
| 2.256000000000004 | 2.094 | -5.289 | 151.397 |
| 2.260000000000004 | 2.136 | -5.314 | 151.924 |
| 2.264000000000004 | 2.178 | -5.339 | 152.451 |
| 2.268000000000004 | 2.221 | -5.363 | 152.98 |
| 2.272000000000004 | 2.264 | -5.387 | 153.51 |
| 2.276000000000004 | 2.307 | -5.411 | 154.041 |
| 2.280000000000004 | 2.351 | -5.434 | 154.573 |
| 2.284000000000004 | 2.395 | -5.457 | 155.106 |
| 2.288000000000004 | 2.439 | -5.479 | 155.641 |
| 2.292000000000004 | 2.484 | -5.501 | 156.176 |
| 2.296000000000004 | 2.529 | -5.523 | 156.713 |
| 2.300000000000004 | 2.574 | -5.544 | 157.251 |
| 2.304000000000004 | 2.62 | -5.565 | 157.79 |
| 2.308000000000004 | 2.665 | -5.585 | 158.33 |
| 2.312000000000004 | 2.711 | -5.605 | 158.871 |
| 2.316000000000004 | 2.758 | -5.624 | 159.414 |
| 2.320000000000004 | 2.805 | -5.643 | 159.958 |
| 2.324000000000004 | 2.852 | -5.662 | 160.502 |
| 2.328000000000004 | 2.899 | -5.68 | 161.048 |
| 2.332000000000004 | 2.947 | -5.698 | 161.595 |
| 2.336000000000004 | 2.995 | -5.715 | 162.143 |
| 2.340000000000004 | 3.043 | -5.732 | 162.693 |
| 2.344000000000004 | 3.092 | -5.748 | 163.243 |
| 2.348000000000004 | 3.141 | -5.764 | 163.795 |
| 2.352000000000004 | 3.19 | -5.78 | 164.348 |
| 2.356000000000004 | 3.24 | -5.795 | 164.902 |
| 2.360000000000004 | 3.29 | -5.809 | 165.457 |
| 2.364000000000004 | 3.34 | -5.823 | 166.013 |
| 2.368000000000004 | 3.391 | -5.837 | 166.571 |
| 2.372000000000004 | 3.442 | -5.85 | 167.129 |
| 2.376000000000004 | 3.493 | -5.862 | 167.689 |
| 2.380000000000004 | 3.545 | -5.875 | 168.25 |
| 2.384000000000004 | 3.597 | -5.886 | 168.812 |
| 2.388000000000004 | 3.649 | -5.897 | 169.375 |
| 2.392000000000004 | 3.702 | -5.908 | 169.94 |
| 2.396000000000004 | 3.755 | -5.918 | 170.505 |
| 2.400000000000004 | 3.808 | -5.928 | 171.072 |
| 2.404000000000004 | 3.862 | -5.937 | 171.64 |
| 2.408000000000004 | 3.916 | -5.946 | 172.209 |
| 2.412000000000004 | 3.97 | -5.954 | 172.779 |
| 2.416000000000004 | 4.024 | -5.962 | 173.351 |
| 2.420000000000004 | 4.079 | -5.969 | 173.923 |
| 2.424000000000004 | 4.135 | -5.976 | 174.497 |
| 2.428000000000004 | 4.19 | -5.982 | 175.072 |
| 2.432000000000004 | 4.246 | -5.987 | 175.648 |
| 2.436000000000004 | 4.303 | -5.992 | 176.226 |
| 2.440000000000004 | 4.359 | -5.997 | 176.804 |
| 2.444000000000004 | 4.416 | -6.001 | 177.384 |
| 2.448000000000004 | 4.473 | -6.004 | 177.965 |
| 2.452000000000004 | 4.531 | -6.007 | 178.547 |
| 2.456000000000004 | 4.589 | -6.01 | 179.13 |
| 2.460000000000004 | 4.647 | -6.012 | 179.715 |
| 2.464000000000004 | 4.706 | -6.013 | 180.3 |
| 2.468000000000004 | 4.765 | -6.014 | 180.887 |
| 2.472000000000004 | 4.825 | -6.014 | 181.475 |
| 2.476000000000004 | 4.884 | -6.014 | 182.065 |
| 2.480000000000004 | 4.944 | -6.013 | 182.655 |
| 2.484000000000004 | 5.005 | -6.011 | 183.247 |
| 2.488000000000004 | 5.066 | -6.009 | 183.839 |
| 2.492000000000004 | 5.127 | -6.007 | 184.433 |
| 2.496000000000004 | 5.188 | -6.004 | 185.029 |
| 2.500000000000004 | 5.25 | -6 | 185.625 |
| 2.504000000000004 | 5.312 | -5.996 | 186.223 |
| 2.508000000000004 | 5.375 | -5.991 | 186.821 |
| 2.512000000000004 | 5.438 | -5.985 | 187.421 |
| 2.516000000000004 | 5.501 | -5.979 | 188.023 |
| 2.520000000000004 | 5.564 | -5.973 | 188.625 |
| 2.524000000000004 | 5.628 | -5.966 | 189.229 |
| 2.528000000000004 | 5.693 | -5.958 | 189.833 |
| 2.532000000000004 | 5.757 | -5.949 | 190.439 |
| 2.536000000000004 | 5.822 | -5.94 | 191.047 |
| 2.540000000000004 | 5.888 | -5.931 | 191.655 |
| 2.544000000000004 | 5.953 | -5.92 | 192.265 |
| 2.548000000000004 | 6.02 | -5.91 | 192.876 |
| 2.552000000000004 | 6.086 | -5.898 | 193.488 |
| 2.556000000000004 | 6.153 | -5.886 | 194.101 |
| 2.560000000000004 | 6.22 | -5.873 | 194.716 |
| 2.564000000000004 | 6.288 | -5.86 | 195.331 |
| 2.568000000000004 | 6.355 | -5.846 | 195.948 |
| 2.572000000000004 | 6.424 | -5.832 | 196.567 |
| 2.576000000000004 | 6.492 | -5.817 | 197.186 |
| 2.580000000000004 | 6.561 | -5.801 | 197.807 |
| 2.584000000000004 | 6.631 | -5.784 | 198.428 |
| 2.588000000000005 | 6.701 | -5.767 | 199.051 |
| 2.592000000000004 | 6.771 | -5.749 | 199.676 |
| 2.596000000000004 | 6.841 | -5.731 | 200.301 |
| 2.600000000000004 | 6.912 | -5.712 | 200.928 |
| 2.604000000000004 | 6.983 | -5.692 | 201.556 |
| 2.608000000000004 | 7.055 | -5.672 | 202.185 |
| 2.612000000000004 | 7.127 | -5.651 | 202.816 |
| 2.616000000000004 | 7.199 | -5.629 | 203.447 |
| 2.620000000000004 | 7.272 | -5.607 | 204.08 |
| 2.624000000000004 | 7.345 | -5.584 | 204.714 |
| 2.628000000000004 | 7.418 | -5.56 | 205.35 |
| 2.632000000000004 | 7.492 | -5.536 | 205.986 |
| 2.636000000000004 | 7.566 | -5.511 | 206.624 |
| 2.640000000000004 | 7.641 | -5.485 | 207.263 |
| 2.644000000000004 | 7.716 | -5.459 | 207.904 |
| 2.648000000000004 | 7.791 | -5.432 | 208.545 |
| 2.652000000000004 | 7.867 | -5.404 | 209.188 |
| 2.656000000000004 | 7.943 | -5.376 | 209.832 |
| 2.660000000000004 | 8.02 | -5.346 | 210.477 |
| 2.664000000000004 | 8.097 | -5.317 | 211.124 |
| 2.668000000000004 | 8.174 | -5.286 | 211.772 |
| 2.672000000000004 | 8.252 | -5.255 | 212.421 |
| 2.676000000000004 | 8.33 | -5.223 | 213.071 |
| 2.680000000000004 | 8.408 | -5.19 | 213.722 |
| 2.684000000000004 | 8.487 | -5.157 | 214.375 |
| 2.688000000000005 | 8.566 | -5.123 | 215.029 |
| 2.692000000000004 | 8.646 | -5.088 | 215.685 |
| 2.696000000000004 | 8.726 | -5.052 | 216.341 |
| 2.700000000000005 | 8.806 | -5.016 | 216.999 |
| 2.704000000000005 | 8.887 | -4.979 | 217.658 |
| 2.708000000000005 | 8.968 | -4.941 | 218.318 |
| 2.712000000000005 | 9.049 | -4.903 | 218.98 |
| 2.716000000000005 | 9.131 | -4.864 | 219.643 |
| 2.720000000000005 | 9.214 | -4.824 | 220.307 |
| 2.724000000000005 | 9.296 | -4.783 | 220.972 |
| 2.728000000000005 | 9.38 | -4.741 | 221.639 |
| 2.732000000000005 | 9.463 | -4.699 | 222.307 |
| 2.736000000000005 | 9.547 | -4.656 | 222.976 |
| 2.740000000000005 | 9.631 | -4.613 | 223.646 |
| 2.744000000000005 | 9.716 | -4.568 | 224.318 |
| 2.748000000000005 | 9.801 | -4.523 | 224.991 |
| 2.752000000000005 | 9.887 | -4.477 | 225.665 |
| 2.756000000000005 | 9.972 | -4.43 | 226.341 |
| 2.760000000000005 | 10.059 | -4.383 | 227.018 |
| 2.764000000000005 | 10.145 | -4.334 | 227.696 |
| 2.768000000000005 | 10.233 | -4.285 | 228.375 |
| 2.772000000000005 | 10.32 | -4.235 | 229.056 |
| 2.776000000000005 | 10.408 | -4.185 | 229.738 |
| 2.780000000000005 | 10.496 | -4.133 | 230.421 |
| 2.784000000000005 | 10.585 | -4.081 | 231.105 |
| 2.788000000000005 | 10.674 | -4.028 | 231.791 |
| 2.792000000000005 | 10.764 | -3.974 | 232.478 |
| 2.796000000000005 | 10.854 | -3.919 | 233.166 |
| 2.800000000000005 | 10.944 | -3.864 | 233.856 |
| 2.804000000000005 | 11.035 | -3.808 | 234.547 |
| 2.808000000000005 | 11.126 | -3.751 | 235.239 |
| 2.812000000000005 | 11.218 | -3.693 | 235.933 |
| 2.816000000000005 | 11.31 | -3.634 | 236.627 |
| 2.820000000000005 | 11.402 | -3.575 | 237.323 |
| 2.824000000000005 | 11.495 | -3.514 | 238.021 |
| 2.828000000000005 | 11.588 | -3.453 | 238.719 |
| 2.832000000000005 | 11.682 | -3.391 | 239.419 |
| 2.836000000000005 | 11.776 | -3.328 | 240.12 |
| 2.840000000000005 | 11.87 | -3.265 | 240.823 |
| 2.844000000000005 | 11.965 | -3.2 | 241.527 |
| 2.848000000000005 | 12.06 | -3.135 | 242.232 |
| 2.852000000000005 | 12.156 | -3.069 | 242.938 |
| 2.856000000000005 | 12.252 | -3.002 | 243.646 |
| 2.860000000000005 | 12.349 | -2.934 | 244.355 |
| 2.864000000000005 | 12.446 | -2.865 | 245.065 |
| 2.868000000000005 | 12.543 | -2.796 | 245.777 |
| 2.872000000000005 | 12.641 | -2.725 | 246.49 |
| 2.876000000000005 | 12.739 | -2.654 | 247.204 |
| 2.880000000000005 | 12.838 | -2.582 | 247.92 |
| 2.884000000000005 | 12.937 | -2.509 | 248.636 |
| 2.888000000000005 | 13.037 | -2.435 | 249.355 |
| 2.892000000000005 | 13.137 | -2.36 | 250.074 |
| 2.896000000000005 | 13.237 | -2.285 | 250.795 |
| 2.900000000000005 | 13.338 | -2.208 | 251.517 |
| 2.904000000000005 | 13.439 | -2.131 | 252.24 |
| 2.908000000000005 | 13.541 | -2.052 | 252.965 |
| 2.912000000000005 | 13.643 | -1.973 | 253.691 |
| 2.916000000000005 | 13.746 | -1.893 | 254.419 |
| 2.920000000000005 | 13.849 | -1.812 | 255.147 |
| 2.924000000000005 | 13.952 | -1.73 | 255.877 |
| 2.928000000000005 | 14.056 | -1.647 | 256.609 |
| 2.932000000000005 | 14.16 | -1.564 | 257.341 |
| 2.936000000000005 | 14.265 | -1.479 | 258.075 |
| 2.940000000000005 | 14.37 | -1.394 | 258.811 |
| 2.944000000000005 | 14.476 | -1.307 | 259.547 |
| 2.948000000000005 | 14.582 | -1.22 | 260.285 |
| 2.952000000000005 | 14.688 | -1.132 | 261.024 |
| 2.956000000000005 | 14.795 | -1.043 | 261.765 |
| 2.960000000000005 | 14.902 | -0.953 | 262.507 |
| 2.964000000000005 | 15.01 | -0.861 | 263.25 |
| 2.968000000000005 | 15.118 | -0.77 | 263.995 |
| 2.972000000000005 | 15.227 | -0.677 | 264.741 |
| 2.976000000000005 | 15.336 | -0.583 | 265.488 |
| 2.980000000000005 | 15.446 | -0.488 | 266.237 |
| 2.984000000000005 | 15.556 | -0.392 | 266.987 |
| 2.988000000000005 | 15.666 | -0.296 | 267.738 |
| 2.992000000000005 | 15.777 | -0.198 | 268.491 |
| 2.996000000000005 | 15.888 | -0.1 | 269.245 |
| 3.000000000000005 | 16 | 0 | 270 |
| 3.004000000000005 | 16.112 | 0.1 | 270.757 |
| 3.008000000000005 | 16.225 | 0.202 | 271.515 |
| 3.012000000000005 | 16.338 | 0.304 | 272.274 |
| 3.016000000000005 | 16.452 | 0.408 | 273.035 |
| 3.020000000000005 | 16.566 | 0.512 | 273.797 |
| 3.024000000000005 | 16.68 | 0.617 | 274.56 |
| 3.028000000000005 | 16.795 | 0.724 | 275.325 |
| 3.032000000000005 | 16.91 | 0.831 | 276.091 |
| 3.036000000000005 | 17.026 | 0.939 | 276.859 |
| 3.040000000000005 | 17.143 | 1.049 | 277.627 |
| 3.044000000000005 | 17.259 | 1.159 | 278.398 |
| 3.048000000000005 | 17.376 | 1.27 | 279.169 |
| 3.052000000000005 | 17.494 | 1.382 | 279.942 |
| 3.056000000000005 | 17.612 | 1.495 | 280.716 |
| 3.060000000000005 | 17.731 | 1.61 | 281.492 |
| 3.064000000000005 | 17.85 | 1.725 | 282.269 |
| 3.068000000000005 | 17.969 | 1.841 | 283.047 |
| 3.072000000000005 | 18.089 | 1.959 | 283.827 |
| 3.076000000000005 | 18.21 | 2.077 | 284.608 |
| 3.080000000000005 | 18.331 | 2.196 | 285.39 |
| 3.084000000000005 | 18.452 | 2.316 | 286.174 |
| 3.088000000000005 | 18.574 | 2.438 | 286.959 |
| 3.092000000000005 | 18.696 | 2.56 | 287.746 |
| 3.096000000000005 | 18.819 | 2.684 | 288.534 |
| 3.100000000000005 | 18.942 | 2.808 | 289.323 |
| 3.104000000000005 | 19.066 | 2.933 | 290.114 |
| 3.108000000000005 | 19.19 | 3.06 | 290.906 |
| 3.112000000000005 | 19.314 | 3.188 | 291.699 |
| 3.116000000000005 | 19.44 | 3.316 | 292.494 |
| 3.120000000000005 | 19.565 | 3.446 | 293.29 |
| 3.124000000000005 | 19.691 | 3.577 | 294.088 |
| 3.128000000000005 | 19.818 | 3.708 | 294.886 |
| 3.132000000000005 | 19.945 | 3.841 | 295.687 |
| 3.136000000000005 | 20.072 | 3.975 | 296.488 |
| 3.140000000000005 | 20.2 | 4.11 | 297.291 |
| 3.144000000000005 | 20.328 | 4.246 | 298.096 |
| 3.148000000000005 | 20.457 | 4.383 | 298.902 |
| 3.152000000000005 | 20.586 | 4.521 | 299.709 |
| 3.156000000000005 | 20.716 | 4.66 | 300.518 |
| 3.160000000000005 | 20.847 | 4.801 | 301.327 |
| 3.164000000000005 | 20.977 | 4.942 | 302.139 |
| 3.168000000000005 | 21.109 | 5.085 | 302.952 |
| 3.172000000000005 | 21.24 | 5.228 | 303.766 |
| 3.176000000000005 | 21.373 | 5.373 | 304.581 |
| 3.180000000000005 | 21.505 | 5.519 | 305.398 |
| 3.184000000000005 | 21.638 | 5.666 | 306.217 |
| 3.188000000000005 | 21.772 | 5.813 | 307.036 |
| 3.192000000000005 | 21.906 | 5.963 | 307.858 |
| 3.196000000000005 | 22.041 | 6.113 | 308.68 |
| 3.200000000000005 | 22.176 | 6.264 | 309.504 |
| 3.204000000000005 | 22.312 | 6.416 | 310.329 |
| 3.208000000000005 | 22.448 | 6.57 | 311.156 |
| 3.212000000000005 | 22.584 | 6.725 | 311.984 |
| 3.216000000000005 | 22.721 | 6.88 | 312.814 |
| 3.220000000000005 | 22.859 | 7.037 | 313.645 |
| 3.224000000000005 | 22.997 | 7.195 | 314.477 |
| 3.228000000000005 | 23.135 | 7.354 | 315.311 |
| 3.232000000000005 | 23.275 | 7.515 | 316.146 |
| 3.236000000000005 | 23.414 | 7.676 | 316.983 |
| 3.240000000000005 | 23.554 | 7.839 | 317.821 |
| 3.244000000000005 | 23.695 | 8.002 | 318.66 |
| 3.248000000000005 | 23.836 | 8.167 | 319.501 |
| 3.252000000000005 | 23.977 | 8.333 | 320.343 |
| 3.256000000000005 | 24.119 | 8.5 | 321.187 |
| 3.260000000000005 | 24.262 | 8.669 | 322.032 |
| 3.264000000000005 | 24.405 | 8.838 | 322.878 |
| 3.268000000000005 | 24.548 | 9.009 | 323.726 |
| 3.272000000000005 | 24.692 | 9.181 | 324.576 |
| 3.276000000000005 | 24.837 | 9.353 | 325.426 |
| 3.280000000000005 | 24.982 | 9.528 | 326.279 |
| 3.284000000000005 | 25.127 | 9.703 | 327.132 |
| 3.288000000000005 | 25.273 | 9.879 | 327.987 |
| 3.292000000000005 | 25.419 | 10.057 | 328.844 |
| 3.296000000000005 | 25.566 | 10.236 | 329.702 |
| 3.300000000000005 | 25.714 | 10.416 | 330.561 |
| 3.304000000000005 | 25.862 | 10.597 | 331.422 |
| 3.308000000000005 | 26.011 | 10.78 | 332.284 |
| 3.312000000000005 | 26.16 | 10.963 | 333.148 |
| 3.316000000000005 | 26.309 | 11.148 | 334.013 |
| 3.320000000000005 | 26.459 | 11.334 | 334.879 |
| 3.324000000000005 | 26.61 | 11.521 | 335.747 |
| 3.328000000000005 | 26.761 | 11.71 | 336.616 |
| 3.332000000000005 | 26.912 | 11.899 | 337.487 |
| 3.336000000000005 | 27.064 | 12.09 | 338.359 |
| 3.340000000000005 | 27.217 | 12.282 | 339.233 |
| 3.344000000000005 | 27.37 | 12.476 | 340.108 |
| 3.348000000000005 | 27.524 | 12.67 | 340.985 |
| 3.352000000000005 | 27.678 | 12.866 | 341.863 |
| 3.356000000000005 | 27.833 | 13.063 | 342.742 |
| 3.360000000000005 | 27.988 | 13.261 | 343.623 |
| 3.364000000000005 | 28.143 | 13.461 | 344.506 |
| 3.368000000000005 | 28.3 | 13.661 | 345.389 |
| 3.372000000000005 | 28.456 | 13.863 | 346.275 |
| 3.376000000000005 | 28.614 | 14.067 | 347.161 |
| 3.380000000000005 | 28.771 | 14.271 | 348.049 |
| 3.384000000000005 | 28.93 | 14.477 | 348.939 |
| 3.388000000000005 | 29.088 | 14.684 | 349.83 |
| 3.392000000000005 | 29.248 | 14.892 | 350.723 |
| 3.396000000000005 | 29.408 | 15.101 | 351.617 |
| 3.400000000000005 | 29.568 | 15.312 | 352.512 |
| 3.404000000000005 | 29.729 | 15.524 | 353.409 |
| 3.408000000000005 | 29.89 | 15.737 | 354.307 |
| 3.412000000000005 | 30.052 | 15.952 | 355.207 |
| 3.416000000000005 | 30.215 | 16.168 | 356.108 |
| 3.420000000000005 | 30.378 | 16.385 | 357.011 |
| 3.424000000000005 | 30.541 | 16.603 | 357.915 |
| 3.428000000000005 | 30.705 | 16.823 | 358.821 |
| 3.432000000000005 | 30.87 | 17.044 | 359.728 |
| 3.436000000000005 | 31.035 | 17.266 | 360.637 |
| 3.440000000000005 | 31.201 | 17.489 | 361.547 |
| 3.444000000000005 | 31.367 | 17.714 | 362.458 |
| 3.448000000000005 | 31.534 | 17.94 | 363.371 |
| 3.452000000000005 | 31.701 | 18.168 | 364.286 |
| 3.456000000000005 | 31.869 | 18.397 | 365.202 |
| 3.460000000000005 | 32.037 | 18.627 | 366.119 |
| 3.464000000000005 | 32.206 | 18.858 | 367.038 |
| 3.468000000000005 | 32.375 | 19.091 | 367.959 |
| 3.472000000000005 | 32.545 | 19.325 | 368.88 |
| 3.476000000000005 | 32.716 | 19.56 | 369.804 |
| 3.480000000000005 | 32.887 | 19.797 | 370.729 |
| 3.484000000000005 | 33.058 | 20.035 | 371.655 |
| 3.488000000000005 | 33.23 | 20.274 | 372.583 |
| 3.492000000000005 | 33.403 | 20.515 | 373.512 |
| 3.496000000000005 | 33.576 | 20.757 | 374.443 |
| 3.500000000000005 | 33.75 | 21 | 375.375 |
| 3.504000000000005 | 33.924 | 21.245 | 376.309 |
| 3.508000000000005 | 34.099 | 21.491 | 377.244 |
| 3.512000000000005 | 34.274 | 21.738 | 378.181 |
| 3.516000000000005 | 34.45 | 21.987 | 379.119 |
| 3.520000000000005 | 34.627 | 22.237 | 380.059 |
| 3.524000000000005 | 34.804 | 22.488 | 381 |
| 3.528000000000005 | 34.981 | 22.741 | 381.943 |
| 3.532000000000005 | 35.159 | 22.995 | 382.887 |
| 3.536000000000005 | 35.338 | 23.251 | 383.832 |
| 3.540000000000005 | 35.517 | 23.508 | 384.78 |
| 3.544000000000005 | 35.697 | 23.766 | 385.728 |
| 3.548000000000005 | 35.877 | 24.026 | 386.678 |
| 3.552000000000005 | 36.058 | 24.287 | 387.63 |
| 3.556000000000005 | 36.24 | 24.549 | 388.583 |
| 3.560000000000005 | 36.422 | 24.813 | 389.538 |
| 3.564000000000005 | 36.604 | 25.078 | 390.494 |
| 3.568000000000005 | 36.787 | 25.345 | 391.452 |
| 3.572000000000005 | 36.971 | 25.613 | 392.411 |
| 3.576000000000005 | 37.155 | 25.882 | 393.372 |
| 3.580000000000005 | 37.34 | 26.153 | 394.334 |
| 3.584000000000005 | 37.525 | 26.425 | 395.298 |
| 3.588000000000005 | 37.711 | 26.699 | 396.263 |
| 3.592000000000005 | 37.897 | 26.974 | 397.23 |
| 3.596000000000005 | 38.084 | 27.25 | 398.198 |
| 3.600000000000005 | 38.272 | 27.528 | 399.168 |
| 3.604000000000005 | 38.46 | 27.807 | 400.139 |
| 3.608000000000005 | 38.649 | 28.088 | 401.112 |
| 3.612000000000005 | 38.838 | 28.37 | 402.087 |
| 3.616000000000005 | 39.028 | 28.654 | 403.062 |
| 3.620000000000005 | 39.218 | 28.939 | 404.04 |
| 3.624000000000005 | 39.409 | 29.225 | 405.019 |
| 3.628000000000005 | 39.601 | 29.513 | 405.999 |
| 3.632000000000005 | 39.793 | 29.802 | 406.981 |
| 3.636000000000005 | 39.985 | 30.093 | 407.965 |
| 3.640000000000005 | 40.179 | 30.385 | 408.95 |
| 3.644000000000005 | 40.372 | 30.679 | 409.936 |
| 3.648000000000005 | 40.567 | 30.974 | 410.924 |
| 3.652000000000005 | 40.762 | 31.27 | 411.914 |
| 3.656000000000005 | 40.957 | 31.568 | 412.905 |
| 3.660000000000005 | 41.153 | 31.868 | 413.898 |
| 3.664000000000005 | 41.35 | 32.169 | 414.892 |
| 3.668000000000005 | 41.547 | 32.471 | 415.888 |
| 3.672000000000005 | 41.745 | 32.775 | 416.885 |
| 3.676000000000005 | 41.943 | 33.081 | 417.884 |
| 3.680000000000005 | 42.142 | 33.387 | 418.884 |
| 3.684000000000005 | 42.342 | 33.696 | 419.886 |
| 3.688000000000005 | 42.542 | 34.006 | 420.889 |
| 3.692000000000005 | 42.743 | 34.317 | 421.894 |
| 3.696000000000005 | 42.944 | 34.63 | 422.901 |
| 3.700000000000005 | 43.146 | 34.944 | 423.909 |
| 3.704000000000005 | 43.348 | 35.26 | 424.919 |
| 3.708000000000005 | 43.551 | 35.577 | 425.93 |
| 3.712000000000005 | 43.755 | 35.896 | 426.942 |
| 3.716000000000005 | 43.959 | 36.216 | 427.957 |
| 3.720000000000005 | 44.164 | 36.538 | 428.973 |
| 3.724000000000005 | 44.369 | 36.861 | 429.99 |
| 3.728000000000005 | 44.575 | 37.186 | 431.009 |
| 3.732000000000005 | 44.782 | 37.513 | 432.029 |
| 3.736000000000005 | 44.989 | 37.84 | 433.051 |
| 3.740000000000005 | 45.197 | 38.17 | 434.075 |
| 3.744000000000005 | 45.405 | 38.501 | 435.1 |
| 3.748000000000005 | 45.614 | 38.833 | 436.127 |
| 3.752000000000005 | 45.824 | 39.167 | 437.155 |
| 3.756000000000005 | 46.034 | 39.503 | 438.185 |
| 3.760000000000005 | 46.244 | 39.84 | 439.216 |
| 3.764000000000005 | 46.456 | 40.178 | 440.249 |
| 3.768000000000005 | 46.668 | 40.519 | 441.284 |
| 3.772000000000005 | 46.88 | 40.86 | 442.32 |
| 3.776000000000005 | 47.093 | 41.204 | 443.357 |
| 3.780000000000005 | 47.307 | 41.548 | 444.396 |
| 3.784000000000005 | 47.521 | 41.895 | 445.437 |
| 3.788000000000006 | 47.736 | 42.243 | 446.48 |
| 3.792000000000005 | 47.951 | 42.592 | 447.523 |
| 3.796000000000005 | 48.167 | 42.943 | 448.569 |
| 3.800000000000006 | 48.384 | 43.296 | 449.616 |
| 3.804000000000006 | 48.601 | 43.65 | 450.665 |
| 3.808000000000006 | 48.819 | 44.006 | 451.715 |
| 3.812000000000006 | 49.038 | 44.363 | 452.767 |
| 3.816000000000006 | 49.257 | 44.722 | 453.82 |
| 3.820000000000006 | 49.476 | 45.083 | 454.875 |
| 3.824000000000006 | 49.697 | 45.445 | 455.931 |
| 3.828000000000006 | 49.918 | 45.809 | 456.99 |
| 3.832000000000006 | 50.139 | 46.174 | 458.049 |
| 3.836000000000006 | 50.361 | 46.541 | 459.11 |
| 3.840000000000006 | 50.584 | 46.91 | 460.173 |
| 3.844000000000006 | 50.807 | 47.28 | 461.238 |
| 3.848000000000006 | 51.031 | 47.652 | 462.304 |
| 3.852000000000006 | 51.256 | 48.025 | 463.371 |
| 3.856000000000006 | 51.481 | 48.4 | 464.441 |
| 3.860000000000006 | 51.707 | 48.776 | 465.511 |
| 3.864000000000006 | 51.933 | 49.155 | 466.584 |
| 3.868000000000006 | 52.16 | 49.534 | 467.658 |
| 3.872000000000006 | 52.387 | 49.916 | 468.733 |
| 3.876000000000006 | 52.616 | 50.299 | 469.81 |
| 3.880000000000006 | 52.845 | 50.684 | 470.889 |
| 3.884000000000006 | 53.074 | 51.07 | 471.97 |
| 3.888000000000006 | 53.304 | 51.458 | 473.052 |
| 3.892000000000006 | 53.535 | 51.848 | 474.135 |
| 3.896000000000006 | 53.766 | 52.239 | 475.22 |
| 3.900000000000006 | 53.998 | 52.632 | 476.307 |
| 3.904000000000006 | 54.231 | 53.027 | 477.395 |
| 3.908000000000006 | 54.464 | 53.423 | 478.485 |
| 3.912000000000006 | 54.698 | 53.821 | 479.577 |
| 3.916000000000006 | 54.932 | 54.22 | 480.67 |
| 3.920000000000006 | 55.167 | 54.622 | 481.765 |
| 3.924000000000006 | 55.403 | 55.024 | 482.861 |
| 3.928000000000006 | 55.639 | 55.429 | 483.959 |
| 3.932000000000006 | 55.876 | 55.835 | 485.059 |
| 3.936000000000006 | 56.113 | 56.243 | 486.16 |
| 3.940000000000006 | 56.352 | 56.653 | 487.263 |
| 3.944000000000006 | 56.59 | 57.064 | 488.367 |
| 3.948000000000006 | 56.83 | 57.477 | 489.473 |
| 3.952000000000006 | 57.07 | 57.892 | 490.581 |
| 3.956000000000006 | 57.311 | 58.308 | 491.69 |
| 3.960000000000006 | 57.552 | 58.726 | 492.801 |
| 3.964000000000006 | 57.794 | 59.146 | 493.914 |
| 3.968000000000006 | 58.036 | 59.567 | 495.028 |
| 3.972000000000006 | 58.28 | 59.99 | 496.144 |
| 3.976000000000006 | 58.523 | 60.415 | 497.261 |
| 3.980000000000006 | 58.768 | 60.842 | 498.38 |
| 3.984000000000006 | 59.013 | 61.27 | 499.501 |
| 3.988000000000006 | 59.259 | 61.7 | 500.623 |
| 3.992000000000006 | 59.505 | 62.131 | 501.747 |
| 3.996000000000006 | 59.752 | 62.565 | 502.873 |
| 4.000000000000005 | 60 | 63 | 504 |
| 4.004000000000005 | 60.248 | 63.437 | 505.129 |
| 4.008000000000004 | 60.497 | 63.875 | 506.259 |
| 4.012000000000004 | 60.747 | 64.316 | 507.391 |
| 4.016000000000004 | 60.997 | 64.758 | 508.525 |
| 4.020000000000003 | 61.248 | 65.202 | 509.66 |
| 4.024000000000003 | 61.5 | 65.647 | 510.797 |
| 4.028000000000002 | 61.752 | 66.095 | 511.936 |
| 4.032000000000002 | 62.005 | 66.544 | 513.076 |
| 4.036000000000001 | 62.258 | 66.994 | 514.218 |
| 4.040000000000001 | 62.512 | 67.447 | 515.362 |
| 4.044 | 62.767 | 67.901 | 516.507 |
| 4.048 | 63.022 | 68.357 | 517.654 |
| 4.052 | 63.278 | 68.815 | 518.802 |
| 4.055999999999999 | 63.535 | 69.275 | 519.952 |
| 4.059999999999999 | 63.792 | 69.736 | 521.104 |
| 4.063999999999998 | 64.05 | 70.199 | 522.258 |
| 4.067999999999998 | 64.309 | 70.664 | 523.413 |
| 4.071999999999997 | 64.568 | 71.131 | 524.57 |
| 4.075999999999997 | 64.828 | 71.599 | 525.728 |
| 4.079999999999996 | 65.089 | 72.07 | 526.888 |
| 4.083999999999996 | 65.35 | 72.542 | 528.05 |
| 4.087999999999996 | 65.612 | 73.016 | 529.213 |
| 4.091999999999995 | 65.875 | 73.491 | 530.378 |
| 4.095999999999995 | 66.138 | 73.969 | 531.545 |
| 4.099999999999994 | 66.402 | 74.448 | 532.713 |
| 4.103999999999994 | 66.667 | 74.929 | 533.883 |
| 4.107999999999993 | 66.932 | 75.412 | 535.055 |
| 4.111999999999993 | 67.198 | 75.897 | 536.228 |
| 4.115999999999993 | 67.464 | 76.383 | 537.403 |
| 4.119999999999992 | 67.731 | 76.871 | 538.58 |
| 4.123999999999992 | 67.999 | 77.362 | 539.758 |
| 4.127999999999991 | 68.268 | 77.854 | 540.938 |
| 4.131999999999991 | 68.537 | 78.347 | 542.12 |
| 4.13599999999999 | 68.807 | 78.843 | 543.303 |
| 4.13999999999999 | 69.077 | 79.34 | 544.488 |
| 4.143999999999989 | 69.349 | 79.84 | 545.674 |
| 4.147999999999989 | 69.621 | 80.341 | 546.863 |
| 4.151999999999989 | 69.893 | 80.844 | 548.053 |
| 4.155999999999988 | 70.166 | 81.349 | 549.245 |
| 4.159999999999988 | 70.44 | 81.855 | 550.438 |
| 4.163999999999987 | 70.715 | 82.364 | 551.633 |
| 4.167999999999987 | 70.99 | 82.874 | 552.83 |
| 4.171999999999986 | 71.266 | 83.386 | 554.028 |
| 4.175999999999986 | 71.542 | 83.9 | 555.228 |
| 4.179999999999985 | 71.82 | 84.416 | 556.43 |
| 4.183999999999985 | 72.098 | 84.934 | 557.633 |
| 4.187999999999985 | 72.376 | 85.454 | 558.838 |
| 4.191999999999984 | 72.655 | 85.975 | 560.045 |
| 4.195999999999984 | 72.935 | 86.499 | 561.254 |
| 4.199999999999983 | 73.216 | 87.024 | 562.464 |
| 4.203999999999983 | 73.497 | 87.551 | 563.676 |
| 4.207999999999982 | 73.779 | 88.08 | 564.889 |
| 4.211999999999982 | 74.062 | 88.611 | 566.105 |
| 4.215999999999982 | 74.345 | 89.144 | 567.322 |
| 4.219999999999981 | 74.629 | 89.679 | 568.54 |
| 4.223999999999981 | 74.914 | 90.215 | 569.761 |
| 4.22799999999998 | 75.199 | 90.754 | 570.983 |
| 4.23199999999998 | 75.485 | 91.294 | 572.206 |
| 4.23599999999998 | 75.772 | 91.837 | 573.432 |
| 4.239999999999978 | 76.06 | 92.381 | 574.659 |
| 4.243999999999978 | 76.348 | 92.927 | 575.888 |
| 4.247999999999978 | 76.637 | 93.475 | 577.118 |
| 4.251999999999977 | 76.926 | 94.025 | 578.351 |
| 4.255999999999977 | 77.216 | 94.577 | 579.585 |
| 4.259999999999976 | 77.507 | 95.131 | 580.82 |
| 4.263999999999976 | 77.799 | 95.687 | 582.058 |
| 4.267999999999976 | 78.091 | 96.244 | 583.297 |
| 4.271999999999975 | 78.384 | 96.804 | 584.538 |
| 4.275999999999974 | 78.678 | 97.366 | 585.78 |
| 4.279999999999974 | 78.972 | 97.929 | 587.024 |
| 4.283999999999974 | 79.267 | 98.495 | 588.27 |
| 4.287999999999974 | 79.563 | 99.062 | 589.518 |
| 4.291999999999973 | 79.859 | 99.631 | 590.767 |
| 4.295999999999973 | 80.156 | 100.203 | 592.018 |
| 4.299999999999972 | 80.454 | 100.776 | 593.271 |
| 4.303999999999972 | 80.753 | 101.351 | 594.525 |
| 4.307999999999971 | 81.052 | 101.928 | 595.782 |
| 4.311999999999971 | 81.352 | 102.508 | 597.04 |
| 4.31599999999997 | 81.652 | 103.089 | 598.299 |
| 4.31999999999997 | 81.954 | 103.672 | 599.561 |
| 4.32399999999997 | 82.256 | 104.257 | 600.824 |
| 4.327999999999969 | 82.558 | 104.844 | 602.089 |
| 4.331999999999968 | 82.862 | 105.433 | 603.355 |
| 4.335999999999968 | 83.166 | 106.024 | 604.623 |
| 4.339999999999967 | 83.471 | 106.617 | 605.894 |
| 4.343999999999967 | 83.776 | 107.212 | 607.165 |
| 4.347999999999967 | 84.082 | 107.809 | 608.439 |
| 4.351999999999966 | 84.389 | 108.408 | 609.714 |
| 4.355999999999966 | 84.697 | 109.009 | 610.991 |
| 4.359999999999965 | 85.005 | 109.612 | 612.27 |
| 4.363999999999965 | 85.314 | 110.217 | 613.55 |
| 4.367999999999965 | 85.624 | 110.824 | 614.832 |
| 4.371999999999964 | 85.935 | 111.433 | 616.116 |
| 4.375999999999964 | 86.246 | 112.044 | 617.402 |
| 4.379999999999963 | 86.558 | 112.657 | 618.689 |
| 4.383999999999963 | 86.87 | 113.272 | 619.978 |
| 4.387999999999963 | 87.184 | 113.889 | 621.269 |
| 4.391999999999962 | 87.498 | 114.508 | 622.562 |
| 4.395999999999962 | 87.813 | 115.129 | 623.856 |
| 4.399999999999961 | 88.128 | 115.752 | 625.152 |
| 4.40399999999996 | 88.444 | 116.377 | 626.45 |
| 4.40799999999996 | 88.761 | 117.004 | 627.749 |
| 4.41199999999996 | 89.079 | 117.634 | 629.051 |
| 4.415999999999959 | 89.397 | 118.265 | 630.354 |
| 4.41999999999996 | 89.716 | 118.898 | 631.659 |
| 4.423999999999959 | 90.036 | 119.534 | 632.965 |
| 4.427999999999958 | 90.356 | 120.171 | 634.274 |
| 4.431999999999957 | 90.678 | 120.811 | 635.584 |
| 4.435999999999957 | 91 | 121.452 | 636.896 |
| 4.439999999999956 | 91.322 | 122.096 | 638.209 |
| 4.443999999999956 | 91.646 | 122.742 | 639.525 |
| 4.447999999999956 | 91.97 | 123.389 | 640.842 |
| 4.451999999999955 | 92.295 | 124.039 | 642.161 |
| 4.455999999999955 | 92.62 | 124.691 | 643.481 |
| 4.459999999999954 | 92.947 | 125.345 | 644.804 |
| 4.463999999999954 | 93.274 | 126.001 | 646.128 |
| 4.467999999999954 | 93.601 | 126.659 | 647.454 |
| 4.471999999999953 | 93.93 | 127.32 | 648.781 |
| 4.475999999999953 | 94.259 | 127.982 | 650.111 |
| 4.479999999999952 | 94.589 | 128.646 | 651.442 |
| 4.483999999999952 | 94.92 | 129.313 | 652.775 |
| 4.487999999999952 | 95.251 | 129.981 | 654.11 |
| 4.491999999999951 | 95.583 | 130.652 | 655.447 |
| 4.495999999999951 | 95.916 | 131.325 | 656.785 |
| 4.49999999999995 | 96.25 | 132 | 658.125 |
| 4.50399999999995 | 96.584 | 132.677 | 659.467 |
| 4.507999999999949 | 96.919 | 133.356 | 660.811 |
| 4.511999999999949 | 97.255 | 134.038 | 662.156 |
| 4.515999999999948 | 97.592 | 134.721 | 663.503 |
| 4.519999999999948 | 97.929 | 135.406 | 664.852 |
| 4.523999999999948 | 98.267 | 136.094 | 666.203 |
| 4.527999999999947 | 98.606 | 136.784 | 667.556 |
| 4.531999999999946 | 98.946 | 137.476 | 668.91 |
| 4.535999999999946 | 99.286 | 138.17 | 670.266 |
| 4.539999999999945 | 99.627 | 138.866 | 671.624 |
| 4.543999999999945 | 99.969 | 139.564 | 672.984 |
| 4.547999999999945 | 100.311 | 140.265 | 674.345 |
| 4.551999999999944 | 100.654 | 140.968 | 675.708 |
| 4.555999999999944 | 100.998 | 141.672 | 677.074 |
| 4.559999999999944 | 101.343 | 142.379 | 678.44 |
| 4.563999999999943 | 101.689 | 143.088 | 679.809 |
| 4.567999999999943 | 102.035 | 143.8 | 681.18 |
| 4.571999999999942 | 102.382 | 144.513 | 682.552 |
| 4.575999999999942 | 102.73 | 145.229 | 683.926 |
| 4.579999999999941 | 103.078 | 145.946 | 685.302 |
| 4.583999999999941 | 103.427 | 146.666 | 686.679 |
| 4.587999999999941 | 103.777 | 147.389 | 688.059 |
| 4.59199999999994 | 104.128 | 148.113 | 689.44 |
| 4.59599999999994 | 104.48 | 148.839 | 690.823 |
| 4.59999999999994 | 104.832 | 149.568 | 692.208 |
| 4.603999999999939 | 105.185 | 150.299 | 693.595 |
| 4.607999999999938 | 105.539 | 151.032 | 694.983 |
| 4.611999999999938 | 105.893 | 151.767 | 696.373 |
| 4.615999999999937 | 106.249 | 152.505 | 697.765 |
| 4.619999999999937 | 106.605 | 153.244 | 699.159 |
| 4.623999999999937 | 106.961 | 153.986 | 700.555 |
| 4.627999999999936 | 107.319 | 154.73 | 701.953 |
| 4.631999999999935 | 107.677 | 155.476 | 703.352 |
| 4.635999999999935 | 108.036 | 156.225 | 704.753 |
| 4.639999999999934 | 108.396 | 156.976 | 706.156 |
| 4.643999999999934 | 108.757 | 157.728 | 707.561 |
| 4.647999999999934 | 109.118 | 158.484 | 708.967 |
| 4.651999999999933 | 109.48 | 159.241 | 710.376 |
| 4.655999999999933 | 109.843 | 160.001 | 711.786 |
| 4.659999999999933 | 110.207 | 160.762 | 713.198 |
| 4.663999999999932 | 110.571 | 161.526 | 714.612 |
| 4.667999999999932 | 110.937 | 162.293 | 716.028 |
| 4.671999999999931 | 111.303 | 163.061 | 717.445 |
| 4.675999999999931 | 111.669 | 163.832 | 718.865 |
| 4.67999999999993 | 112.037 | 164.605 | 720.286 |
| 4.68399999999993 | 112.405 | 165.38 | 721.709 |
| 4.687999999999929 | 112.774 | 166.158 | 723.134 |
| 4.69199999999993 | 113.144 | 166.938 | 724.56 |
| 4.695999999999929 | 113.515 | 167.72 | 725.989 |
| 4.699999999999928 | 113.886 | 168.504 | 727.419 |
| 4.703999999999927 | 114.258 | 169.291 | 728.851 |
| 4.707999999999927 | 114.631 | 170.079 | 730.285 |
| 4.711999999999926 | 115.005 | 170.871 | 731.721 |
| 4.715999999999926 | 115.379 | 171.664 | 733.159 |
| 4.719999999999925 | 115.754 | 172.46 | 734.598 |
| 4.723999999999925 | 116.131 | 173.258 | 736.039 |
| 4.727999999999925 | 116.507 | 174.058 | 737.483 |
| 4.731999999999924 | 116.885 | 174.86 | 738.928 |
| 4.735999999999924 | 117.263 | 175.665 | 740.375 |
| 4.739999999999923 | 117.642 | 176.472 | 741.823 |
| 4.743999999999923 | 118.022 | 177.282 | 743.274 |
| 4.747999999999923 | 118.403 | 178.093 | 744.726 |
| 4.751999999999922 | 118.785 | 178.907 | 746.18 |
| 4.755999999999922 | 119.167 | 179.724 | 747.637 |
| 4.759999999999921 | 119.55 | 180.542 | 749.095 |
| 4.763999999999921 | 119.934 | 181.363 | 750.554 |
| 4.767999999999921 | 120.318 | 182.186 | 752.016 |
| 4.77199999999992 | 120.704 | 183.012 | 753.479 |
| 4.77599999999992 | 121.09 | 183.84 | 754.945 |
| 4.77999999999992 | 121.477 | 184.67 | 756.412 |
| 4.783999999999919 | 121.865 | 185.503 | 757.881 |
| 4.787999999999918 | 122.253 | 186.337 | 759.352 |
| 4.791999999999918 | 122.643 | 187.175 | 760.825 |
| 4.795999999999918 | 123.033 | 188.014 | 762.299 |
| 4.799999999999917 | 123.424 | 188.856 | 763.776 |
| 4.803999999999917 | 123.816 | 189.7 | 765.254 |
| 4.807999999999916 | 124.208 | 190.547 | 766.735 |
| 4.811999999999916 | 124.602 | 191.396 | 768.217 |
| 4.815999999999915 | 124.996 | 192.247 | 769.701 |
| 4.819999999999915 | 125.391 | 193.101 | 771.187 |
| 4.823999999999915 | 125.786 | 193.957 | 772.674 |
| 4.827999999999914 | 126.183 | 194.815 | 774.164 |
| 4.831999999999914 | 126.58 | 195.676 | 775.655 |
| 4.835999999999913 | 126.978 | 196.539 | 777.149 |
| 4.839999999999913 | 127.377 | 197.404 | 778.644 |
| 4.843999999999912 | 127.777 | 198.272 | 780.141 |
| 4.847999999999912 | 128.178 | 199.142 | 781.64 |
| 4.851999999999911 | 128.579 | 200.015 | 783.141 |
| 4.855999999999911 | 128.981 | 200.89 | 784.643 |
| 4.859999999999911 | 129.384 | 201.767 | 786.148 |
| 4.86399999999991 | 129.788 | 202.647 | 787.654 |
| 4.86799999999991 | 130.192 | 203.529 | 789.163 |
| 4.87199999999991 | 130.598 | 204.413 | 790.673 |
| 4.875999999999909 | 131.004 | 205.3 | 792.185 |
| 4.879999999999908 | 131.411 | 206.189 | 793.699 |
| 4.883999999999908 | 131.819 | 207.081 | 795.215 |
| 4.887999999999907 | 132.227 | 207.975 | 796.732 |
| 4.891999999999907 | 132.637 | 208.872 | 798.252 |
| 4.895999999999907 | 133.047 | 209.771 | 799.774 |
| 4.899999999999906 | 133.458 | 210.672 | 801.297 |
| 4.903999999999905 | 133.87 | 211.576 | 802.822 |
| 4.907999999999905 | 134.283 | 212.482 | 804.35 |
| 4.911999999999904 | 134.696 | 213.391 | 805.879 |
| 4.915999999999904 | 135.11 | 214.302 | 807.41 |
| 4.919999999999904 | 135.525 | 215.215 | 808.942 |
| 4.923999999999904 | 135.941 | 216.131 | 810.477 |
| 4.927999999999903 | 136.358 | 217.049 | 812.014 |
| 4.931999999999902 | 136.776 | 217.97 | 813.552 |
| 4.935999999999902 | 137.194 | 218.893 | 815.093 |
| 4.939999999999901 | 137.613 | 219.819 | 816.635 |
| 4.943999999999901 | 138.033 | 220.747 | 818.18 |
| 4.947999999999901 | 138.454 | 221.678 | 819.726 |
| 4.9519999999999 | 138.876 | 222.611 | 821.274 |
| 4.9559999999999 | 139.298 | 223.546 | 822.824 |
| 4.9599999999999 | 139.721 | 224.484 | 824.376 |
| 4.9639999999999 | 140.146 | 225.425 | 825.93 |
| 4.967999999999899 | 140.571 | 226.368 | 827.485 |
| 4.971999999999898 | 140.996 | 227.313 | 829.043 |
| 4.975999999999897 | 141.423 | 228.261 | 830.603 |
| 4.979999999999897 | 141.85 | 229.211 | 832.164 |
| 4.983999999999896 | 142.279 | 230.164 | 833.727 |
| 4.987999999999896 | 142.708 | 231.119 | 835.293 |
| 4.991999999999896 | 143.138 | 232.077 | 836.86 |
| 4.995999999999895 | 143.568 | 233.037 | 838.429 |
| 4.999999999999895 | 144 | 234 | 840 |